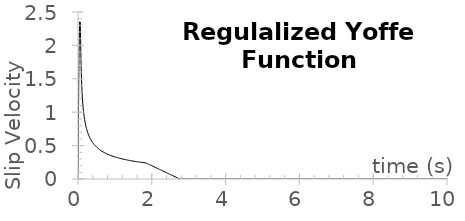
| Category | velocity |
|---|---|
| 0.0 | 0 |
| 0.01 | 0.806 |
| 0.02 | 1.444 |
| 0.03 | 1.914 |
| 0.04 | 2.217 |
| 0.05 | 2.352 |
| 0.06 | 2.32 |
| 0.07 | 2.119 |
| 0.08 | 1.798 |
| 0.09 | 1.57 |
| 0.1 | 1.412 |
| 0.11 | 1.293 |
| 0.12 | 1.2 |
| 0.13 | 1.125 |
| 0.14 | 1.062 |
| 0.15 | 1.009 |
| 0.16 | 0.963 |
| 0.17 | 0.922 |
| 0.18 | 0.887 |
| 0.19 | 0.855 |
| 0.2 | 0.826 |
| 0.21 | 0.801 |
| 0.22 | 0.777 |
| 0.23 | 0.755 |
| 0.24 | 0.735 |
| 0.25 | 0.717 |
| 0.26 | 0.7 |
| 0.27 | 0.684 |
| 0.28 | 0.669 |
| 0.29 | 0.655 |
| 0.3 | 0.642 |
| 0.31 | 0.63 |
| 0.32 | 0.618 |
| 0.33 | 0.607 |
| 0.34 | 0.596 |
| 0.35 | 0.586 |
| 0.36 | 0.577 |
| 0.37 | 0.568 |
| 0.38 | 0.559 |
| 0.39 | 0.551 |
| 0.4 | 0.543 |
| 0.41 | 0.536 |
| 0.42 | 0.528 |
| 0.43 | 0.521 |
| 0.44 | 0.515 |
| 0.45 | 0.508 |
| 0.46 | 0.502 |
| 0.47 | 0.496 |
| 0.48 | 0.49 |
| 0.49 | 0.485 |
| 0.5 | 0.479 |
| 0.51 | 0.474 |
| 0.52 | 0.469 |
| 0.53 | 0.464 |
| 0.54 | 0.46 |
| 0.55 | 0.455 |
| 0.56 | 0.45 |
| 0.57 | 0.446 |
| 0.58 | 0.442 |
| 0.59 | 0.438 |
| 0.6 | 0.434 |
| 0.61 | 0.43 |
| 0.62 | 0.426 |
| 0.63 | 0.422 |
| 0.64 | 0.419 |
| 0.65 | 0.415 |
| 0.66 | 0.412 |
| 0.67 | 0.409 |
| 0.68 | 0.405 |
| 0.69 | 0.402 |
| 0.7 | 0.399 |
| 0.71 | 0.396 |
| 0.72 | 0.393 |
| 0.73 | 0.39 |
| 0.74 | 0.387 |
| 0.75 | 0.385 |
| 0.76 | 0.382 |
| 0.77 | 0.379 |
| 0.78 | 0.377 |
| 0.79 | 0.374 |
| 0.8 | 0.372 |
| 0.81 | 0.369 |
| 0.82 | 0.367 |
| 0.83 | 0.365 |
| 0.84 | 0.362 |
| 0.85 | 0.36 |
| 0.86 | 0.358 |
| 0.87 | 0.356 |
| 0.88 | 0.353 |
| 0.89 | 0.351 |
| 0.9 | 0.349 |
| 0.91 | 0.347 |
| 0.92 | 0.345 |
| 0.93 | 0.343 |
| 0.94 | 0.341 |
| 0.95 | 0.339 |
| 0.96 | 0.338 |
| 0.97 | 0.336 |
| 0.98 | 0.334 |
| 0.99 | 0.332 |
| 1.0 | 0.33 |
| 1.01 | 0.329 |
| 1.02 | 0.327 |
| 1.03 | 0.325 |
| 1.04 | 0.324 |
| 1.05 | 0.322 |
| 1.06 | 0.32 |
| 1.07 | 0.319 |
| 1.08 | 0.317 |
| 1.09 | 0.316 |
| 1.1 | 0.314 |
| 1.11 | 0.313 |
| 1.12 | 0.311 |
| 1.13 | 0.31 |
| 1.14 | 0.308 |
| 1.15 | 0.307 |
| 1.16 | 0.306 |
| 1.17 | 0.304 |
| 1.18 | 0.303 |
| 1.19 | 0.302 |
| 1.2 | 0.3 |
| 1.21 | 0.299 |
| 1.22 | 0.298 |
| 1.23 | 0.296 |
| 1.24 | 0.295 |
| 1.25 | 0.294 |
| 1.26 | 0.293 |
| 1.27 | 0.292 |
| 1.28 | 0.29 |
| 1.29 | 0.289 |
| 1.3 | 0.288 |
| 1.31 | 0.287 |
| 1.32 | 0.286 |
| 1.33 | 0.285 |
| 1.34 | 0.284 |
| 1.35 | 0.282 |
| 1.36 | 0.281 |
| 1.37 | 0.28 |
| 1.38 | 0.279 |
| 1.39 | 0.278 |
| 1.4 | 0.277 |
| 1.41 | 0.276 |
| 1.42 | 0.275 |
| 1.43 | 0.274 |
| 1.44 | 0.273 |
| 1.45 | 0.272 |
| 1.46 | 0.271 |
| 1.47 | 0.27 |
| 1.48 | 0.269 |
| 1.49 | 0.268 |
| 1.5 | 0.268 |
| 1.51 | 0.267 |
| 1.52 | 0.266 |
| 1.53 | 0.265 |
| 1.54 | 0.264 |
| 1.55 | 0.263 |
| 1.56 | 0.262 |
| 1.57 | 0.261 |
| 1.58 | 0.26 |
| 1.59 | 0.26 |
| 1.6 | 0.259 |
| 1.61 | 0.258 |
| 1.62 | 0.257 |
| 1.63 | 0.256 |
| 1.64 | 0.255 |
| 1.65 | 0.255 |
| 1.66 | 0.254 |
| 1.67 | 0.253 |
| 1.68 | 0.252 |
| 1.69 | 0.252 |
| 1.7 | 0.251 |
| 1.71 | 0.25 |
| 1.72 | 0.249 |
| 1.73 | 0.249 |
| 1.74 | 0.248 |
| 1.75 | 0.247 |
| 1.76 | 0.246 |
| 1.77 | 0.246 |
| 1.78 | 0.245 |
| 1.79 | 0.244 |
| 1.8 | 0.244 |
| 1.81 | 0.243 |
| 1.82 | 0.242 |
| 1.83 | 0.241 |
| 1.84 | 0.241 |
| 1.85 | 0.238 |
| 1.86 | 0.236 |
| 1.87 | 0.233 |
| 1.88 | 0.23 |
| 1.89 | 0.228 |
| 1.9 | 0.225 |
| 1.91 | 0.222 |
| 1.92 | 0.22 |
| 1.93 | 0.217 |
| 1.94 | 0.215 |
| 1.95 | 0.212 |
| 1.96 | 0.209 |
| 1.97 | 0.207 |
| 1.98 | 0.204 |
| 1.99 | 0.202 |
| 2.0 | 0.199 |
| 2.01 | 0.196 |
| 2.02 | 0.194 |
| 2.03 | 0.191 |
| 2.04 | 0.188 |
| 2.05 | 0.186 |
| 2.06 | 0.183 |
| 2.07 | 0.181 |
| 2.08 | 0.178 |
| 2.09 | 0.175 |
| 2.1 | 0.173 |
| 2.11 | 0.17 |
| 2.12 | 0.168 |
| 2.13 | 0.165 |
| 2.14 | 0.162 |
| 2.15 | 0.16 |
| 2.16 | 0.157 |
| 2.17 | 0.154 |
| 2.18 | 0.152 |
| 2.19 | 0.149 |
| 2.2 | 0.147 |
| 2.21 | 0.144 |
| 2.22 | 0.141 |
| 2.23 | 0.139 |
| 2.24 | 0.136 |
| 2.25 | 0.133 |
| 2.26 | 0.131 |
| 2.27 | 0.128 |
| 2.28 | 0.126 |
| 2.29 | 0.123 |
| 2.3 | 0.12 |
| 2.31 | 0.118 |
| 2.32 | 0.115 |
| 2.33 | 0.113 |
| 2.34 | 0.11 |
| 2.35 | 0.107 |
| 2.36 | 0.105 |
| 2.37 | 0.102 |
| 2.38 | 0.099 |
| 2.39 | 0.097 |
| 2.4 | 0.094 |
| 2.41 | 0.092 |
| 2.42 | 0.089 |
| 2.43 | 0.086 |
| 2.44 | 0.084 |
| 2.45 | 0.081 |
| 2.46 | 0.079 |
| 2.47 | 0.076 |
| 2.48 | 0.073 |
| 2.49 | 0.071 |
| 2.5 | 0.068 |
| 2.51 | 0.065 |
| 2.52 | 0.063 |
| 2.53 | 0.06 |
| 2.54 | 0.058 |
| 2.55 | 0.055 |
| 2.56 | 0.052 |
| 2.57 | 0.05 |
| 2.58 | 0.047 |
| 2.59 | 0.044 |
| 2.6 | 0.042 |
| 2.61 | 0.039 |
| 2.62 | 0.037 |
| 2.63 | 0.034 |
| 2.64 | 0.031 |
| 2.65 | 0.029 |
| 2.66 | 0.026 |
| 2.67 | 0.024 |
| 2.68 | 0.021 |
| 2.69 | 0.018 |
| 2.7 | 0.016 |
| 2.71 | 0.013 |
| 2.72 | 0.01 |
| 2.73 | 0.008 |
| 2.74 | 0.005 |
| 2.75 | 0.003 |
| 2.76 | 0 |
| 2.77 | 0 |
| 2.78 | 0 |
| 2.79 | 0 |
| 2.8 | 0 |
| 2.81 | 0 |
| 2.82 | 0 |
| 2.83 | 0 |
| 2.84 | 0 |
| 2.85 | 0 |
| 2.86 | 0 |
| 2.87 | 0 |
| 2.88 | 0 |
| 2.89 | 0 |
| 2.9 | 0 |
| 2.91 | 0 |
| 2.92 | 0 |
| 2.93 | 0 |
| 2.94 | 0 |
| 2.95 | 0 |
| 2.96 | 0 |
| 2.97 | 0 |
| 2.98 | 0 |
| 2.99 | 0 |
| 3.0 | 0 |
| 3.01 | 0 |
| 3.02 | 0 |
| 3.03 | 0 |
| 3.04 | 0 |
| 3.05 | 0 |
| 3.06 | 0 |
| 3.07 | 0 |
| 3.08 | 0 |
| 3.09 | 0 |
| 3.1 | 0 |
| 3.11 | 0 |
| 3.12 | 0 |
| 3.13 | 0 |
| 3.14 | 0 |
| 3.15 | 0 |
| 3.16 | 0 |
| 3.17 | 0 |
| 3.18 | 0 |
| 3.19 | 0 |
| 3.2 | 0 |
| 3.21 | 0 |
| 3.22 | 0 |
| 3.23 | 0 |
| 3.24 | 0 |
| 3.25 | 0 |
| 3.26 | 0 |
| 3.27 | 0 |
| 3.28 | 0 |
| 3.29 | 0 |
| 3.3 | 0 |
| 3.31 | 0 |
| 3.32 | 0 |
| 3.33 | 0 |
| 3.34 | 0 |
| 3.35 | 0 |
| 3.36 | 0 |
| 3.37 | 0 |
| 3.38 | 0 |
| 3.39 | 0 |
| 3.4 | 0 |
| 3.41 | 0 |
| 3.42 | 0 |
| 3.43 | 0 |
| 3.44 | 0 |
| 3.45 | 0 |
| 3.46 | 0 |
| 3.47 | 0 |
| 3.48 | 0 |
| 3.49 | 0 |
| 3.5 | 0 |
| 3.51 | 0 |
| 3.52 | 0 |
| 3.53 | 0 |
| 3.54 | 0 |
| 3.55 | 0 |
| 3.56 | 0 |
| 3.57 | 0 |
| 3.58 | 0 |
| 3.59 | 0 |
| 3.6 | 0 |
| 3.61 | 0 |
| 3.62 | 0 |
| 3.63 | 0 |
| 3.64 | 0 |
| 3.65 | 0 |
| 3.66 | 0 |
| 3.67 | 0 |
| 3.68 | 0 |
| 3.69 | 0 |
| 3.7 | 0 |
| 3.71 | 0 |
| 3.72 | 0 |
| 3.73 | 0 |
| 3.74 | 0 |
| 3.75 | 0 |
| 3.76 | 0 |
| 3.77 | 0 |
| 3.78 | 0 |
| 3.79 | 0 |
| 3.8 | 0 |
| 3.81 | 0 |
| 3.82 | 0 |
| 3.83 | 0 |
| 3.84 | 0 |
| 3.85 | 0 |
| 3.86 | 0 |
| 3.87 | 0 |
| 3.88 | 0 |
| 3.89 | 0 |
| 3.9 | 0 |
| 3.91 | 0 |
| 3.92 | 0 |
| 3.93 | 0 |
| 3.94 | 0 |
| 3.95 | 0 |
| 3.96 | 0 |
| 3.97 | 0 |
| 3.98 | 0 |
| 3.99 | 0 |
| 4.0 | 0 |
| 4.01 | 0 |
| 4.02 | 0 |
| 4.03 | 0 |
| 4.04 | 0 |
| 4.05 | 0 |
| 4.06 | 0 |
| 4.07 | 0 |
| 4.08 | 0 |
| 4.09 | 0 |
| 4.1 | 0 |
| 4.11 | 0 |
| 4.12 | 0 |
| 4.13 | 0 |
| 4.14 | 0 |
| 4.15 | 0 |
| 4.16 | 0 |
| 4.17 | 0 |
| 4.18 | 0 |
| 4.19 | 0 |
| 4.2 | 0 |
| 4.21 | 0 |
| 4.22 | 0 |
| 4.23 | 0 |
| 4.24 | 0 |
| 4.25 | 0 |
| 4.26 | 0 |
| 4.27 | 0 |
| 4.28 | 0 |
| 4.29 | 0 |
| 4.3 | 0 |
| 4.31 | 0 |
| 4.32 | 0 |
| 4.33 | 0 |
| 4.34 | 0 |
| 4.35 | 0 |
| 4.36 | 0 |
| 4.37 | 0 |
| 4.38 | 0 |
| 4.39 | 0 |
| 4.4 | 0 |
| 4.41 | 0 |
| 4.42 | 0 |
| 4.43 | 0 |
| 4.44 | 0 |
| 4.45 | 0 |
| 4.46 | 0 |
| 4.47 | 0 |
| 4.48 | 0 |
| 4.49 | 0 |
| 4.5 | 0 |
| 4.51 | 0 |
| 4.52 | 0 |
| 4.53 | 0 |
| 4.54 | 0 |
| 4.55 | 0 |
| 4.56 | 0 |
| 4.57 | 0 |
| 4.58 | 0 |
| 4.59 | 0 |
| 4.6 | 0 |
| 4.61 | 0 |
| 4.62 | 0 |
| 4.63 | 0 |
| 4.64 | 0 |
| 4.65 | 0 |
| 4.66 | 0 |
| 4.67 | 0 |
| 4.68 | 0 |
| 4.69 | 0 |
| 4.7 | 0 |
| 4.71 | 0 |
| 4.72 | 0 |
| 4.73 | 0 |
| 4.74 | 0 |
| 4.75 | 0 |
| 4.76 | 0 |
| 4.77 | 0 |
| 4.78 | 0 |
| 4.79 | 0 |
| 4.8 | 0 |
| 4.81 | 0 |
| 4.82 | 0 |
| 4.83 | 0 |
| 4.84 | 0 |
| 4.85 | 0 |
| 4.86 | 0 |
| 4.87 | 0 |
| 4.88 | 0 |
| 4.89 | 0 |
| 4.9 | 0 |
| 4.91 | 0 |
| 4.92 | 0 |
| 4.93 | 0 |
| 4.94 | 0 |
| 4.95 | 0 |
| 4.96 | 0 |
| 4.97 | 0 |
| 4.98 | 0 |
| 4.99 | 0 |
| 5.0 | 0 |
| 5.01 | 0 |
| 5.02 | 0 |
| 5.03 | 0 |
| 5.04 | 0 |
| 5.05 | 0 |
| 5.06 | 0 |
| 5.07 | 0 |
| 5.08 | 0 |
| 5.09 | 0 |
| 5.1 | 0 |
| 5.11 | 0 |
| 5.12 | 0 |
| 5.13 | 0 |
| 5.14 | 0 |
| 5.15 | 0 |
| 5.16 | 0 |
| 5.17 | 0 |
| 5.18 | 0 |
| 5.19 | 0 |
| 5.2 | 0 |
| 5.21 | 0 |
| 5.22 | 0 |
| 5.23 | 0 |
| 5.24 | 0 |
| 5.25 | 0 |
| 5.26 | 0 |
| 5.27 | 0 |
| 5.28 | 0 |
| 5.29 | 0 |
| 5.3 | 0 |
| 5.31 | 0 |
| 5.32 | 0 |
| 5.33 | 0 |
| 5.34 | 0 |
| 5.35 | 0 |
| 5.36 | 0 |
| 5.37 | 0 |
| 5.38 | 0 |
| 5.39 | 0 |
| 5.4 | 0 |
| 5.41 | 0 |
| 5.42 | 0 |
| 5.43 | 0 |
| 5.44 | 0 |
| 5.45 | 0 |
| 5.46 | 0 |
| 5.47 | 0 |
| 5.48 | 0 |
| 5.49 | 0 |
| 5.5 | 0 |
| 5.51 | 0 |
| 5.52 | 0 |
| 5.53 | 0 |
| 5.54 | 0 |
| 5.55 | 0 |
| 5.56 | 0 |
| 5.57 | 0 |
| 5.58 | 0 |
| 5.59 | 0 |
| 5.6 | 0 |
| 5.61 | 0 |
| 5.62 | 0 |
| 5.63 | 0 |
| 5.64 | 0 |
| 5.65 | 0 |
| 5.66 | 0 |
| 5.67 | 0 |
| 5.68 | 0 |
| 5.69 | 0 |
| 5.7 | 0 |
| 5.71 | 0 |
| 5.72 | 0 |
| 5.73 | 0 |
| 5.74 | 0 |
| 5.75 | 0 |
| 5.76 | 0 |
| 5.77 | 0 |
| 5.78 | 0 |
| 5.79 | 0 |
| 5.8 | 0 |
| 5.81 | 0 |
| 5.82 | 0 |
| 5.83 | 0 |
| 5.84 | 0 |
| 5.85 | 0 |
| 5.86 | 0 |
| 5.87 | 0 |
| 5.88 | 0 |
| 5.89 | 0 |
| 5.9 | 0 |
| 5.91 | 0 |
| 5.92 | 0 |
| 5.93 | 0 |
| 5.94 | 0 |
| 5.95 | 0 |
| 5.96 | 0 |
| 5.97 | 0 |
| 5.98 | 0 |
| 5.99 | 0 |
| 6.0 | 0 |
| 6.01 | 0 |
| 6.02 | 0 |
| 6.03 | 0 |
| 6.04 | 0 |
| 6.05 | 0 |
| 6.06 | 0 |
| 6.07 | 0 |
| 6.08 | 0 |
| 6.09 | 0 |
| 6.1 | 0 |
| 6.11 | 0 |
| 6.12 | 0 |
| 6.13 | 0 |
| 6.14 | 0 |
| 6.15 | 0 |
| 6.16 | 0 |
| 6.17 | 0 |
| 6.18 | 0 |
| 6.19 | 0 |
| 6.2 | 0 |
| 6.21 | 0 |
| 6.22 | 0 |
| 6.23 | 0 |
| 6.24 | 0 |
| 6.25 | 0 |
| 6.26 | 0 |
| 6.27 | 0 |
| 6.28 | 0 |
| 6.29 | 0 |
| 6.3 | 0 |
| 6.31 | 0 |
| 6.32 | 0 |
| 6.33 | 0 |
| 6.34 | 0 |
| 6.35 | 0 |
| 6.36 | 0 |
| 6.37 | 0 |
| 6.38 | 0 |
| 6.39 | 0 |
| 6.4 | 0 |
| 6.41 | 0 |
| 6.42 | 0 |
| 6.43 | 0 |
| 6.44 | 0 |
| 6.45 | 0 |
| 6.46 | 0 |
| 6.47 | 0 |
| 6.48 | 0 |
| 6.49 | 0 |
| 6.5 | 0 |
| 6.51 | 0 |
| 6.52 | 0 |
| 6.53 | 0 |
| 6.54 | 0 |
| 6.55 | 0 |
| 6.56 | 0 |
| 6.57 | 0 |
| 6.58 | 0 |
| 6.59 | 0 |
| 6.6 | 0 |
| 6.61 | 0 |
| 6.62 | 0 |
| 6.63 | 0 |
| 6.64 | 0 |
| 6.65 | 0 |
| 6.66 | 0 |
| 6.67 | 0 |
| 6.68 | 0 |
| 6.69 | 0 |
| 6.7 | 0 |
| 6.71 | 0 |
| 6.72 | 0 |
| 6.73 | 0 |
| 6.74 | 0 |
| 6.75 | 0 |
| 6.76 | 0 |
| 6.77 | 0 |
| 6.78 | 0 |
| 6.79 | 0 |
| 6.8 | 0 |
| 6.81 | 0 |
| 6.82 | 0 |
| 6.83 | 0 |
| 6.84 | 0 |
| 6.85 | 0 |
| 6.86 | 0 |
| 6.87 | 0 |
| 6.88 | 0 |
| 6.89 | 0 |
| 6.9 | 0 |
| 6.91 | 0 |
| 6.92 | 0 |
| 6.93 | 0 |
| 6.94 | 0 |
| 6.95 | 0 |
| 6.96 | 0 |
| 6.97 | 0 |
| 6.98 | 0 |
| 6.99 | 0 |
| 7.0 | 0 |
| 7.01 | 0 |
| 7.02 | 0 |
| 7.03 | 0 |
| 7.04 | 0 |
| 7.05 | 0 |
| 7.06 | 0 |
| 7.07 | 0 |
| 7.08 | 0 |
| 7.09 | 0 |
| 7.1 | 0 |
| 7.11 | 0 |
| 7.12 | 0 |
| 7.13 | 0 |
| 7.14 | 0 |
| 7.15 | 0 |
| 7.16 | 0 |
| 7.17 | 0 |
| 7.18 | 0 |
| 7.19 | 0 |
| 7.2 | 0 |
| 7.21 | 0 |
| 7.22 | 0 |
| 7.23 | 0 |
| 7.24 | 0 |
| 7.25 | 0 |
| 7.26 | 0 |
| 7.27 | 0 |
| 7.28 | 0 |
| 7.29 | 0 |
| 7.3 | 0 |
| 7.31 | 0 |
| 7.32 | 0 |
| 7.33 | 0 |
| 7.34 | 0 |
| 7.35 | 0 |
| 7.36 | 0 |
| 7.37 | 0 |
| 7.38 | 0 |
| 7.39 | 0 |
| 7.4 | 0 |
| 7.41 | 0 |
| 7.42 | 0 |
| 7.43 | 0 |
| 7.44 | 0 |
| 7.45 | 0 |
| 7.46 | 0 |
| 7.47 | 0 |
| 7.48 | 0 |
| 7.49 | 0 |
| 7.5 | 0 |
| 7.51 | 0 |
| 7.52 | 0 |
| 7.53 | 0 |
| 7.54 | 0 |
| 7.55 | 0 |
| 7.56 | 0 |
| 7.57 | 0 |
| 7.58 | 0 |
| 7.59 | 0 |
| 7.6 | 0 |
| 7.61 | 0 |
| 7.62 | 0 |
| 7.63 | 0 |
| 7.64 | 0 |
| 7.65 | 0 |
| 7.66 | 0 |
| 7.67 | 0 |
| 7.68 | 0 |
| 7.69 | 0 |
| 7.7 | 0 |
| 7.71 | 0 |
| 7.72 | 0 |
| 7.73 | 0 |
| 7.74 | 0 |
| 7.75 | 0 |
| 7.76 | 0 |
| 7.77 | 0 |
| 7.78 | 0 |
| 7.79 | 0 |
| 7.8 | 0 |
| 7.81 | 0 |
| 7.82 | 0 |
| 7.83 | 0 |
| 7.84 | 0 |
| 7.85 | 0 |
| 7.86 | 0 |
| 7.87 | 0 |
| 7.88 | 0 |
| 7.89 | 0 |
| 7.9 | 0 |
| 7.91 | 0 |
| 7.92 | 0 |
| 7.93 | 0 |
| 7.94 | 0 |
| 7.95 | 0 |
| 7.96 | 0 |
| 7.97 | 0 |
| 7.98 | 0 |
| 7.99 | 0 |
| 8.0 | 0 |
| 8.01 | 0 |
| 8.02 | 0 |
| 8.03 | 0 |
| 8.04 | 0 |
| 8.05 | 0 |
| 8.06 | 0 |
| 8.07 | 0 |
| 8.08 | 0 |
| 8.09 | 0 |
| 8.1 | 0 |
| 8.11 | 0 |
| 8.12 | 0 |
| 8.13 | 0 |
| 8.14 | 0 |
| 8.15 | 0 |
| 8.16 | 0 |
| 8.17 | 0 |
| 8.18 | 0 |
| 8.19 | 0 |
| 8.2 | 0 |
| 8.21 | 0 |
| 8.22 | 0 |
| 8.23 | 0 |
| 8.24 | 0 |
| 8.25 | 0 |
| 8.26 | 0 |
| 8.27 | 0 |
| 8.28 | 0 |
| 8.29 | 0 |
| 8.3 | 0 |
| 8.31 | 0 |
| 8.32 | 0 |
| 8.33 | 0 |
| 8.34 | 0 |
| 8.35 | 0 |
| 8.36 | 0 |
| 8.37 | 0 |
| 8.38 | 0 |
| 8.39 | 0 |
| 8.4 | 0 |
| 8.41 | 0 |
| 8.42 | 0 |
| 8.43 | 0 |
| 8.44 | 0 |
| 8.45 | 0 |
| 8.46 | 0 |
| 8.47 | 0 |
| 8.48 | 0 |
| 8.49 | 0 |
| 8.5 | 0 |
| 8.51 | 0 |
| 8.52 | 0 |
| 8.53 | 0 |
| 8.54 | 0 |
| 8.55 | 0 |
| 8.56 | 0 |
| 8.57 | 0 |
| 8.58 | 0 |
| 8.59 | 0 |
| 8.6 | 0 |
| 8.61 | 0 |
| 8.62 | 0 |
| 8.63 | 0 |
| 8.64 | 0 |
| 8.65 | 0 |
| 8.66 | 0 |
| 8.67 | 0 |
| 8.68 | 0 |
| 8.69 | 0 |
| 8.7 | 0 |
| 8.71 | 0 |
| 8.72 | 0 |
| 8.73 | 0 |
| 8.74 | 0 |
| 8.75 | 0 |
| 8.76 | 0 |
| 8.77 | 0 |
| 8.78 | 0 |
| 8.79 | 0 |
| 8.8 | 0 |
| 8.81 | 0 |
| 8.82 | 0 |
| 8.83 | 0 |
| 8.84 | 0 |
| 8.85 | 0 |
| 8.86 | 0 |
| 8.87 | 0 |
| 8.88 | 0 |
| 8.89 | 0 |
| 8.9 | 0 |
| 8.91 | 0 |
| 8.92 | 0 |
| 8.93 | 0 |
| 8.94 | 0 |
| 8.95 | 0 |
| 8.96 | 0 |
| 8.97 | 0 |
| 8.98 | 0 |
| 8.99 | 0 |
| 9.0 | 0 |
| 9.01 | 0 |
| 9.02 | 0 |
| 9.03 | 0 |
| 9.04 | 0 |
| 9.05 | 0 |
| 9.06 | 0 |
| 9.07 | 0 |
| 9.08 | 0 |
| 9.09 | 0 |
| 9.1 | 0 |
| 9.11 | 0 |
| 9.12 | 0 |
| 9.13 | 0 |
| 9.14 | 0 |
| 9.15 | 0 |
| 9.16 | 0 |
| 9.17 | 0 |
| 9.18 | 0 |
| 9.19 | 0 |
| 9.2 | 0 |
| 9.21 | 0 |
| 9.22 | 0 |
| 9.23 | 0 |
| 9.24 | 0 |
| 9.25 | 0 |
| 9.26 | 0 |
| 9.27 | 0 |
| 9.28 | 0 |
| 9.29 | 0 |
| 9.3 | 0 |
| 9.31 | 0 |
| 9.32 | 0 |
| 9.33 | 0 |
| 9.34 | 0 |
| 9.35 | 0 |
| 9.36 | 0 |
| 9.37 | 0 |
| 9.38 | 0 |
| 9.39 | 0 |
| 9.4 | 0 |
| 9.41 | 0 |
| 9.42 | 0 |
| 9.43 | 0 |
| 9.44 | 0 |
| 9.45 | 0 |
| 9.46 | 0 |
| 9.47 | 0 |
| 9.48 | 0 |
| 9.49 | 0 |
| 9.5 | 0 |
| 9.51 | 0 |
| 9.52 | 0 |
| 9.53 | 0 |
| 9.54 | 0 |
| 9.55 | 0 |
| 9.56 | 0 |
| 9.57 | 0 |
| 9.58 | 0 |
| 9.59 | 0 |
| 9.6 | 0 |
| 9.61 | 0 |
| 9.62 | 0 |
| 9.63 | 0 |
| 9.64 | 0 |
| 9.65 | 0 |
| 9.66 | 0 |
| 9.67 | 0 |
| 9.68 | 0 |
| 9.69 | 0 |
| 9.7 | 0 |
| 9.71 | 0 |
| 9.72 | 0 |
| 9.73 | 0 |
| 9.74 | 0 |
| 9.75 | 0 |
| 9.76 | 0 |
| 9.77 | 0 |
| 9.78 | 0 |
| 9.79 | 0 |
| 9.8 | 0 |
| 9.81 | 0 |
| 9.82 | 0 |
| 9.83 | 0 |
| 9.84 | 0 |
| 9.85 | 0 |
| 9.86 | 0 |
| 9.87 | 0 |
| 9.88 | 0 |
| 9.89 | 0 |
| 9.9 | 0 |
| 9.91 | 0 |
| 9.92 | 0 |
| 9.93 | 0 |
| 9.94 | 0 |
| 9.95 | 0 |
| 9.96 | 0 |
| 9.97 | 0 |
| 9.98 | 0 |
| 9.99 | 0 |
| 10.0 | 0 |
| 10.01 | 0 |
| 10.02 | 0 |
| 10.03 | 0 |
| 10.04 | 0 |
| 10.05 | 0 |
| 10.06 | 0 |
| 10.07 | 0 |
| 10.08 | 0 |
| 10.09 | 0 |
| 10.1 | 0 |
| 10.11 | 0 |
| 10.12 | 0 |
| 10.13 | 0 |
| 10.14 | 0 |
| 10.15 | 0 |
| 10.16 | 0 |
| 10.17 | 0 |
| 10.18 | 0 |
| 10.19 | 0 |
| 10.2 | 0 |
| 10.21 | 0 |
| 10.22 | 0 |
| 10.23 | 0 |
| 10.24 | 0 |
| 10.25 | 0 |
| 10.26 | 0 |
| 10.27 | 0 |
| 10.28 | 0 |
| 10.29 | 0 |
| 10.3 | 0 |
| 10.31 | 0 |
| 10.32 | 0 |
| 10.33 | 0 |
| 10.34 | 0 |
| 10.35 | 0 |
| 10.36 | 0 |
| 10.37 | 0 |
| 10.38 | 0 |
| 10.39 | 0 |
| 10.4 | 0 |
| 10.41 | 0 |
| 10.42 | 0 |
| 10.43 | 0 |
| 10.44 | 0 |
| 10.45 | 0 |
| 10.46 | 0 |
| 10.47 | 0 |
| 10.48 | 0 |
| 10.49 | 0 |
| 10.5 | 0 |
| 10.51 | 0 |
| 10.52 | 0 |
| 10.53 | 0 |
| 10.54 | 0 |
| 10.55 | 0 |
| 10.56 | 0 |
| 10.57 | 0 |
| 10.58 | 0 |
| 10.59 | 0 |
| 10.6 | 0 |
| 10.61 | 0 |
| 10.62 | 0 |
| 10.63 | 0 |
| 10.64 | 0 |
| 10.65 | 0 |
| 10.66 | 0 |
| 10.67 | 0 |
| 10.68 | 0 |
| 10.69 | 0 |
| 10.7 | 0 |
| 10.71 | 0 |
| 10.72 | 0 |
| 10.73 | 0 |
| 10.74 | 0 |
| 10.75 | 0 |
| 10.76 | 0 |
| 10.77 | 0 |
| 10.78 | 0 |
| 10.79 | 0 |
| 10.8 | 0 |
| 10.81 | 0 |
| 10.82 | 0 |
| 10.83 | 0 |
| 10.84 | 0 |
| 10.85 | 0 |
| 10.86 | 0 |
| 10.87 | 0 |
| 10.88 | 0 |
| 10.89 | 0 |
| 10.9 | 0 |
| 10.91 | 0 |
| 10.92 | 0 |
| 10.93 | 0 |
| 10.94 | 0 |
| 10.95 | 0 |
| 10.96 | 0 |
| 10.97 | 0 |
| 10.98 | 0 |
| 10.99 | 0 |
| 11.0 | 0 |
| 11.01 | 0 |
| 11.02 | 0 |
| 11.03 | 0 |
| 11.04 | 0 |
| 11.05 | 0 |
| 11.06 | 0 |
| 11.07 | 0 |
| 11.08 | 0 |
| 11.09 | 0 |
| 11.1 | 0 |
| 11.11 | 0 |
| 11.12 | 0 |
| 11.13 | 0 |
| 11.14 | 0 |
| 11.15 | 0 |
| 11.16 | 0 |
| 11.17 | 0 |
| 11.18 | 0 |
| 11.19 | 0 |
| 11.2 | 0 |
| 11.21 | 0 |
| 11.22 | 0 |
| 11.23 | 0 |
| 11.24 | 0 |
| 11.25 | 0 |
| 11.26 | 0 |
| 11.27 | 0 |
| 11.28 | 0 |
| 11.29 | 0 |
| 11.3 | 0 |
| 11.31 | 0 |
| 11.32 | 0 |
| 11.33 | 0 |
| 11.34 | 0 |
| 11.35 | 0 |
| 11.36 | 0 |
| 11.37 | 0 |
| 11.38 | 0 |
| 11.39 | 0 |
| 11.4 | 0 |
| 11.41 | 0 |
| 11.42 | 0 |
| 11.43 | 0 |
| 11.44 | 0 |
| 11.45 | 0 |
| 11.46 | 0 |
| 11.47 | 0 |
| 11.48 | 0 |
| 11.49 | 0 |
| 11.5 | 0 |
| 11.51 | 0 |
| 11.52 | 0 |
| 11.53 | 0 |
| 11.54 | 0 |
| 11.55 | 0 |
| 11.56 | 0 |
| 11.57 | 0 |
| 11.58 | 0 |
| 11.59 | 0 |
| 11.6 | 0 |
| 11.61 | 0 |
| 11.62 | 0 |
| 11.63 | 0 |
| 11.64 | 0 |
| 11.65 | 0 |
| 11.66 | 0 |
| 11.67 | 0 |
| 11.68 | 0 |
| 11.69 | 0 |
| 11.7 | 0 |
| 11.71 | 0 |
| 11.72 | 0 |
| 11.73 | 0 |
| 11.74 | 0 |
| 11.75 | 0 |
| 11.76 | 0 |
| 11.77 | 0 |
| 11.78 | 0 |
| 11.79 | 0 |
| 11.8 | 0 |
| 11.81 | 0 |
| 11.82 | 0 |
| 11.83 | 0 |
| 11.84 | 0 |
| 11.85 | 0 |
| 11.86 | 0 |
| 11.87 | 0 |
| 11.88 | 0 |
| 11.89 | 0 |
| 11.9 | 0 |
| 11.91 | 0 |
| 11.92 | 0 |
| 11.93 | 0 |
| 11.94 | 0 |
| 11.95 | 0 |
| 11.96 | 0 |
| 11.97 | 0 |
| 11.98 | 0 |
| 11.99 | 0 |
| 12.0 | 0 |
| 12.01 | 0 |
| 12.02 | 0 |
| 12.03 | 0 |
| 12.04 | 0 |
| 12.05 | 0 |
| 12.06 | 0 |
| 12.07 | 0 |
| 12.08 | 0 |
| 12.09 | 0 |
| 12.1 | 0 |
| 12.11 | 0 |
| 12.12 | 0 |
| 12.13 | 0 |
| 12.14 | 0 |
| 12.15 | 0 |
| 12.16 | 0 |
| 12.17 | 0 |
| 12.18 | 0 |
| 12.19 | 0 |
| 12.2 | 0 |
| 12.21 | 0 |
| 12.22 | 0 |
| 12.23 | 0 |
| 12.24 | 0 |
| 12.25 | 0 |
| 12.26 | 0 |
| 12.27 | 0 |
| 12.28 | 0 |
| 12.29 | 0 |
| 12.3 | 0 |
| 12.31 | 0 |
| 12.32 | 0 |
| 12.33 | 0 |
| 12.34 | 0 |
| 12.35 | 0 |
| 12.36 | 0 |
| 12.37 | 0 |
| 12.38 | 0 |
| 12.39 | 0 |
| 12.4 | 0 |
| 12.41 | 0 |
| 12.42 | 0 |
| 12.43 | 0 |
| 12.44 | 0 |
| 12.45 | 0 |
| 12.46 | 0 |
| 12.47 | 0 |
| 12.48 | 0 |
| 12.49 | 0 |
| 12.5 | 0 |
| 12.51 | 0 |
| 12.52 | 0 |
| 12.53 | 0 |
| 12.54 | 0 |
| 12.55 | 0 |
| 12.56 | 0 |
| 12.57 | 0 |
| 12.58 | 0 |
| 12.59 | 0 |
| 12.6 | 0 |
| 12.61 | 0 |
| 12.62 | 0 |
| 12.63 | 0 |
| 12.64 | 0 |
| 12.65 | 0 |
| 12.66 | 0 |
| 12.67 | 0 |
| 12.68 | 0 |
| 12.69 | 0 |
| 12.7 | 0 |
| 12.71 | 0 |
| 12.72 | 0 |
| 12.73 | 0 |
| 12.74 | 0 |
| 12.75 | 0 |
| 12.76 | 0 |
| 12.77 | 0 |
| 12.78 | 0 |
| 12.79 | 0 |
| 12.8 | 0 |
| 12.81 | 0 |
| 12.82 | 0 |
| 12.83 | 0 |
| 12.84 | 0 |
| 12.85 | 0 |
| 12.86 | 0 |
| 12.87 | 0 |
| 12.88 | 0 |
| 12.89 | 0 |
| 12.9 | 0 |
| 12.91 | 0 |
| 12.92 | 0 |
| 12.93 | 0 |
| 12.94 | 0 |
| 12.95 | 0 |
| 12.96 | 0 |
| 12.97 | 0 |
| 12.98 | 0 |
| 12.99 | 0 |
| 13.0 | 0 |
| 13.01 | 0 |
| 13.02 | 0 |
| 13.03 | 0 |
| 13.04 | 0 |
| 13.05 | 0 |
| 13.06 | 0 |
| 13.07 | 0 |
| 13.08 | 0 |
| 13.09 | 0 |
| 13.1 | 0 |
| 13.11 | 0 |
| 13.12 | 0 |
| 13.13 | 0 |
| 13.14 | 0 |
| 13.15 | 0 |
| 13.16 | 0 |
| 13.17 | 0 |
| 13.18 | 0 |
| 13.19 | 0 |
| 13.2 | 0 |
| 13.21 | 0 |
| 13.22 | 0 |
| 13.23 | 0 |
| 13.24 | 0 |
| 13.25 | 0 |
| 13.26 | 0 |
| 13.27 | 0 |
| 13.28 | 0 |
| 13.29 | 0 |
| 13.3 | 0 |
| 13.31 | 0 |
| 13.32 | 0 |
| 13.33 | 0 |
| 13.34 | 0 |
| 13.35 | 0 |
| 13.36 | 0 |
| 13.37 | 0 |
| 13.38 | 0 |
| 13.39 | 0 |
| 13.4 | 0 |
| 13.41 | 0 |
| 13.42 | 0 |
| 13.43 | 0 |
| 13.44 | 0 |
| 13.45 | 0 |
| 13.46 | 0 |
| 13.47 | 0 |
| 13.48 | 0 |
| 13.49 | 0 |
| 13.5 | 0 |
| 13.51 | 0 |
| 13.52 | 0 |
| 13.53 | 0 |
| 13.54 | 0 |
| 13.55 | 0 |
| 13.56 | 0 |
| 13.57 | 0 |
| 13.58 | 0 |
| 13.59 | 0 |
| 13.6 | 0 |
| 13.61 | 0 |
| 13.62 | 0 |
| 13.63 | 0 |
| 13.64 | 0 |
| 13.65 | 0 |
| 13.66 | 0 |
| 13.67 | 0 |
| 13.68 | 0 |
| 13.69 | 0 |
| 13.7 | 0 |
| 13.71 | 0 |
| 13.72 | 0 |
| 13.73 | 0 |
| 13.74 | 0 |
| 13.75 | 0 |
| 13.76 | 0 |
| 13.77 | 0 |
| 13.78 | 0 |
| 13.79 | 0 |
| 13.8 | 0 |
| 13.81 | 0 |
| 13.82 | 0 |
| 13.83 | 0 |
| 13.84 | 0 |
| 13.85 | 0 |
| 13.86 | 0 |
| 13.87 | 0 |
| 13.88 | 0 |
| 13.89 | 0 |
| 13.9 | 0 |
| 13.91 | 0 |
| 13.92 | 0 |
| 13.93 | 0 |
| 13.94 | 0 |
| 13.95 | 0 |
| 13.96 | 0 |
| 13.97 | 0 |
| 13.98 | 0 |
| 13.99 | 0 |
| 14.0 | 0 |
| 14.01 | 0 |
| 14.02 | 0 |
| 14.03 | 0 |
| 14.04 | 0 |
| 14.05 | 0 |
| 14.06 | 0 |
| 14.07 | 0 |
| 14.08 | 0 |
| 14.09 | 0 |
| 14.1 | 0 |
| 14.11 | 0 |
| 14.12 | 0 |
| 14.13 | 0 |
| 14.14 | 0 |
| 14.15 | 0 |
| 14.16 | 0 |
| 14.17 | 0 |
| 14.18 | 0 |
| 14.19 | 0 |
| 14.2 | 0 |
| 14.21 | 0 |
| 14.22 | 0 |
| 14.23 | 0 |
| 14.24 | 0 |
| 14.25 | 0 |
| 14.26 | 0 |
| 14.27 | 0 |
| 14.28 | 0 |
| 14.29 | 0 |
| 14.3 | 0 |
| 14.31 | 0 |
| 14.32 | 0 |
| 14.33 | 0 |
| 14.34 | 0 |
| 14.35 | 0 |
| 14.36 | 0 |
| 14.37 | 0 |
| 14.38 | 0 |
| 14.39 | 0 |
| 14.4 | 0 |
| 14.41 | 0 |
| 14.42 | 0 |
| 14.43 | 0 |
| 14.44 | 0 |
| 14.45 | 0 |
| 14.46 | 0 |
| 14.47 | 0 |
| 14.48 | 0 |
| 14.49 | 0 |
| 14.5 | 0 |
| 14.51 | 0 |
| 14.52 | 0 |
| 14.53 | 0 |
| 14.54 | 0 |
| 14.55 | 0 |
| 14.56 | 0 |
| 14.57 | 0 |
| 14.58 | 0 |
| 14.59 | 0 |
| 14.6 | 0 |
| 14.61 | 0 |
| 14.62 | 0 |
| 14.63 | 0 |
| 14.64 | 0 |
| 14.65 | 0 |
| 14.66 | 0 |
| 14.67 | 0 |
| 14.68 | 0 |
| 14.69 | 0 |
| 14.7 | 0 |
| 14.71 | 0 |
| 14.72 | 0 |
| 14.73 | 0 |
| 14.74 | 0 |
| 14.75 | 0 |
| 14.76 | 0 |
| 14.77 | 0 |
| 14.78 | 0 |
| 14.79 | 0 |
| 14.8 | 0 |
| 14.81 | 0 |
| 14.82 | 0 |
| 14.83 | 0 |
| 14.84 | 0 |
| 14.85 | 0 |
| 14.86 | 0 |
| 14.87 | 0 |
| 14.88 | 0 |
| 14.89 | 0 |
| 14.9 | 0 |
| 14.91 | 0 |
| 14.92 | 0 |
| 14.93 | 0 |
| 14.94 | 0 |
| 14.95 | 0 |
| 14.96 | 0 |
| 14.97 | 0 |
| 14.98 | 0 |
| 14.99 | 0 |
| 15.0 | 0 |
| 15.01 | 0 |
| 15.02 | 0 |
| 15.03 | 0 |
| 15.04 | 0 |
| 15.05 | 0 |
| 15.06 | 0 |
| 15.07 | 0 |
| 15.08 | 0 |
| 15.09 | 0 |
| 15.1 | 0 |
| 15.11 | 0 |
| 15.12 | 0 |
| 15.13 | 0 |
| 15.14 | 0 |
| 15.15 | 0 |
| 15.16 | 0 |
| 15.17 | 0 |
| 15.18 | 0 |
| 15.19 | 0 |
| 15.2 | 0 |
| 15.21 | 0 |
| 15.22 | 0 |
| 15.23 | 0 |
| 15.24 | 0 |
| 15.25 | 0 |
| 15.26 | 0 |
| 15.27 | 0 |
| 15.28 | 0 |
| 15.29 | 0 |
| 15.3 | 0 |
| 15.31 | 0 |
| 15.32 | 0 |
| 15.33 | 0 |
| 15.34 | 0 |
| 15.35 | 0 |
| 15.36 | 0 |
| 15.37 | 0 |
| 15.38 | 0 |
| 15.39 | 0 |
| 15.4 | 0 |
| 15.41 | 0 |
| 15.42 | 0 |
| 15.43 | 0 |
| 15.44 | 0 |
| 15.45 | 0 |
| 15.46 | 0 |
| 15.47 | 0 |
| 15.48 | 0 |
| 15.49 | 0 |
| 15.5 | 0 |
| 15.51 | 0 |
| 15.52 | 0 |
| 15.53 | 0 |
| 15.54 | 0 |
| 15.55 | 0 |
| 15.56 | 0 |
| 15.57 | 0 |
| 15.58 | 0 |
| 15.59 | 0 |
| 15.6 | 0 |
| 15.61 | 0 |
| 15.62 | 0 |
| 15.63 | 0 |
| 15.64 | 0 |
| 15.65 | 0 |
| 15.66 | 0 |
| 15.67 | 0 |
| 15.68 | 0 |
| 15.69 | 0 |
| 15.7 | 0 |
| 15.71 | 0 |
| 15.72 | 0 |
| 15.73 | 0 |
| 15.74 | 0 |
| 15.75 | 0 |
| 15.76 | 0 |
| 15.77 | 0 |
| 15.78 | 0 |
| 15.79 | 0 |
| 15.8 | 0 |
| 15.81 | 0 |
| 15.82 | 0 |
| 15.83 | 0 |
| 15.84 | 0 |
| 15.85 | 0 |
| 15.86 | 0 |
| 15.87 | 0 |
| 15.88 | 0 |
| 15.89 | 0 |
| 15.9 | 0 |
| 15.91 | 0 |
| 15.92 | 0 |
| 15.93 | 0 |
| 15.94 | 0 |
| 15.95 | 0 |
| 15.96 | 0 |
| 15.97 | 0 |
| 15.98 | 0 |
| 15.99 | 0 |
| 16.0 | 0 |
| 16.01 | 0 |
| 16.02 | 0 |
| 16.03 | 0 |
| 16.04 | 0 |
| 16.05 | 0 |
| 16.06 | 0 |
| 16.07 | 0 |
| 16.08 | 0 |
| 16.09 | 0 |
| 16.1 | 0 |
| 16.11 | 0 |
| 16.12 | 0 |
| 16.13 | 0 |
| 16.14 | 0 |
| 16.15 | 0 |
| 16.16 | 0 |
| 16.17 | 0 |
| 16.18 | 0 |
| 16.19 | 0 |
| 16.2 | 0 |
| 16.21 | 0 |
| 16.22 | 0 |
| 16.23 | 0 |
| 16.24 | 0 |
| 16.25 | 0 |
| 16.26 | 0 |
| 16.27 | 0 |
| 16.28 | 0 |
| 16.29 | 0 |
| 16.3 | 0 |
| 16.31 | 0 |
| 16.32 | 0 |
| 16.33 | 0 |
| 16.34 | 0 |
| 16.35 | 0 |
| 16.36 | 0 |
| 16.37 | 0 |
| 16.38 | 0 |
| 16.39 | 0 |
| 16.4 | 0 |
| 16.41 | 0 |
| 16.42 | 0 |
| 16.43 | 0 |
| 16.44 | 0 |
| 16.45 | 0 |
| 16.46 | 0 |
| 16.47 | 0 |
| 16.48 | 0 |
| 16.49 | 0 |
| 16.5 | 0 |
| 16.51 | 0 |
| 16.52 | 0 |
| 16.53 | 0 |
| 16.54 | 0 |
| 16.55 | 0 |
| 16.56 | 0 |
| 16.57 | 0 |
| 16.58 | 0 |
| 16.59 | 0 |
| 16.6 | 0 |
| 16.61 | 0 |
| 16.62 | 0 |
| 16.63 | 0 |
| 16.64 | 0 |
| 16.65 | 0 |
| 16.66 | 0 |
| 16.67 | 0 |
| 16.68 | 0 |
| 16.69 | 0 |
| 16.7 | 0 |
| 16.71 | 0 |
| 16.72 | 0 |
| 16.73 | 0 |
| 16.74 | 0 |
| 16.75 | 0 |
| 16.76 | 0 |
| 16.77 | 0 |
| 16.78 | 0 |
| 16.79 | 0 |
| 16.8 | 0 |
| 16.81 | 0 |
| 16.82 | 0 |
| 16.83 | 0 |
| 16.84 | 0 |
| 16.85 | 0 |
| 16.86 | 0 |
| 16.87 | 0 |
| 16.88 | 0 |
| 16.89 | 0 |
| 16.9 | 0 |
| 16.91 | 0 |
| 16.92 | 0 |
| 16.93 | 0 |
| 16.94 | 0 |
| 16.95 | 0 |
| 16.96 | 0 |
| 16.97 | 0 |
| 16.98 | 0 |
| 16.99 | 0 |
| 17.0 | 0 |
| 17.01 | 0 |
| 17.02 | 0 |
| 17.03 | 0 |
| 17.04 | 0 |
| 17.05 | 0 |
| 17.06 | 0 |
| 17.07 | 0 |
| 17.08 | 0 |
| 17.09 | 0 |
| 17.1 | 0 |
| 17.11 | 0 |
| 17.12 | 0 |
| 17.13 | 0 |
| 17.14 | 0 |
| 17.15 | 0 |
| 17.16 | 0 |
| 17.17 | 0 |
| 17.18 | 0 |
| 17.19 | 0 |
| 17.2 | 0 |
| 17.21 | 0 |
| 17.22 | 0 |
| 17.23 | 0 |
| 17.24 | 0 |
| 17.25 | 0 |
| 17.26 | 0 |
| 17.27 | 0 |
| 17.28 | 0 |
| 17.29 | 0 |
| 17.3 | 0 |
| 17.31 | 0 |
| 17.32 | 0 |
| 17.33 | 0 |
| 17.34 | 0 |
| 17.35 | 0 |
| 17.36 | 0 |
| 17.37 | 0 |
| 17.38 | 0 |
| 17.39 | 0 |
| 17.4 | 0 |
| 17.41 | 0 |
| 17.42 | 0 |
| 17.43 | 0 |
| 17.44 | 0 |
| 17.45 | 0 |
| 17.46 | 0 |
| 17.47 | 0 |
| 17.48 | 0 |
| 17.49 | 0 |
| 17.5 | 0 |
| 17.51 | 0 |
| 17.52 | 0 |
| 17.53 | 0 |
| 17.54 | 0 |
| 17.55 | 0 |
| 17.56 | 0 |
| 17.57 | 0 |
| 17.58 | 0 |
| 17.59 | 0 |
| 17.6 | 0 |
| 17.61 | 0 |
| 17.62 | 0 |
| 17.63 | 0 |
| 17.64 | 0 |
| 17.65 | 0 |
| 17.66 | 0 |
| 17.67 | 0 |
| 17.68 | 0 |
| 17.69 | 0 |
| 17.7 | 0 |
| 17.71 | 0 |
| 17.72 | 0 |
| 17.73 | 0 |
| 17.74 | 0 |
| 17.75 | 0 |
| 17.76 | 0 |
| 17.77 | 0 |
| 17.78 | 0 |
| 17.79 | 0 |
| 17.8 | 0 |
| 17.81 | 0 |
| 17.82 | 0 |
| 17.83 | 0 |
| 17.84 | 0 |
| 17.85 | 0 |
| 17.86 | 0 |
| 17.87 | 0 |
| 17.88 | 0 |
| 17.89 | 0 |
| 17.9 | 0 |
| 17.91 | 0 |
| 17.92 | 0 |
| 17.93 | 0 |
| 17.94 | 0 |
| 17.95 | 0 |
| 17.96 | 0 |
| 17.97 | 0 |
| 17.98 | 0 |
| 17.99 | 0 |
| 18.0 | 0 |
| 18.01 | 0 |
| 18.02 | 0 |
| 18.03 | 0 |
| 18.04 | 0 |
| 18.05 | 0 |
| 18.06 | 0 |
| 18.07 | 0 |
| 18.08 | 0 |
| 18.09 | 0 |
| 18.1 | 0 |
| 18.11 | 0 |
| 18.12 | 0 |
| 18.13 | 0 |
| 18.14 | 0 |
| 18.15 | 0 |
| 18.16 | 0 |
| 18.17 | 0 |
| 18.18 | 0 |
| 18.19 | 0 |
| 18.2 | 0 |
| 18.21 | 0 |
| 18.22 | 0 |
| 18.23 | 0 |
| 18.24 | 0 |
| 18.25 | 0 |
| 18.26 | 0 |
| 18.27 | 0 |
| 18.28 | 0 |
| 18.29 | 0 |
| 18.3 | 0 |
| 18.31 | 0 |
| 18.32 | 0 |
| 18.33 | 0 |
| 18.34 | 0 |
| 18.35 | 0 |
| 18.36 | 0 |
| 18.37 | 0 |
| 18.38 | 0 |
| 18.39 | 0 |
| 18.4 | 0 |
| 18.41 | 0 |
| 18.42 | 0 |
| 18.43 | 0 |
| 18.44 | 0 |
| 18.45 | 0 |
| 18.46 | 0 |
| 18.47 | 0 |
| 18.48 | 0 |
| 18.49 | 0 |
| 18.5 | 0 |
| 18.51 | 0 |
| 18.52 | 0 |
| 18.53 | 0 |
| 18.54 | 0 |
| 18.55 | 0 |
| 18.56 | 0 |
| 18.57 | 0 |
| 18.58 | 0 |
| 18.59 | 0 |
| 18.6 | 0 |
| 18.61 | 0 |
| 18.62 | 0 |
| 18.63 | 0 |
| 18.64 | 0 |
| 18.65 | 0 |
| 18.66 | 0 |
| 18.67 | 0 |
| 18.68 | 0 |
| 18.69 | 0 |
| 18.7 | 0 |
| 18.71 | 0 |
| 18.72 | 0 |
| 18.73 | 0 |
| 18.74 | 0 |
| 18.75 | 0 |
| 18.76 | 0 |
| 18.77 | 0 |
| 18.78 | 0 |
| 18.79 | 0 |
| 18.8 | 0 |
| 18.81 | 0 |
| 18.82 | 0 |
| 18.83 | 0 |
| 18.84 | 0 |
| 18.85 | 0 |
| 18.86 | 0 |
| 18.87 | 0 |
| 18.88 | 0 |
| 18.89 | 0 |
| 18.9 | 0 |
| 18.91 | 0 |
| 18.92 | 0 |
| 18.93 | 0 |
| 18.94 | 0 |
| 18.95 | 0 |
| 18.96 | 0 |
| 18.97 | 0 |
| 18.98 | 0 |
| 18.99 | 0 |
| 19.0 | 0 |
| 19.01 | 0 |
| 19.02 | 0 |
| 19.03 | 0 |
| 19.04 | 0 |
| 19.05 | 0 |
| 19.06 | 0 |
| 19.07 | 0 |
| 19.08 | 0 |
| 19.09 | 0 |
| 19.1 | 0 |
| 19.11 | 0 |
| 19.12 | 0 |
| 19.13 | 0 |
| 19.14 | 0 |
| 19.15 | 0 |
| 19.16 | 0 |
| 19.17 | 0 |
| 19.18 | 0 |
| 19.19 | 0 |
| 19.2 | 0 |
| 19.21 | 0 |
| 19.22 | 0 |
| 19.23 | 0 |
| 19.24 | 0 |
| 19.25 | 0 |
| 19.26 | 0 |
| 19.27 | 0 |
| 19.28 | 0 |
| 19.29 | 0 |
| 19.3 | 0 |
| 19.31 | 0 |
| 19.32 | 0 |
| 19.33 | 0 |
| 19.34 | 0 |
| 19.35 | 0 |
| 19.36 | 0 |
| 19.37 | 0 |
| 19.38 | 0 |
| 19.39 | 0 |
| 19.4 | 0 |
| 19.41 | 0 |
| 19.42 | 0 |
| 19.43 | 0 |
| 19.44 | 0 |
| 19.45 | 0 |
| 19.46 | 0 |
| 19.47 | 0 |
| 19.48 | 0 |
| 19.49 | 0 |
| 19.5 | 0 |
| 19.51 | 0 |
| 19.52 | 0 |
| 19.53 | 0 |
| 19.54 | 0 |
| 19.55 | 0 |
| 19.56 | 0 |
| 19.57 | 0 |
| 19.58 | 0 |
| 19.59 | 0 |
| 19.6 | 0 |
| 19.61 | 0 |
| 19.62 | 0 |
| 19.63 | 0 |
| 19.64 | 0 |
| 19.65 | 0 |
| 19.66 | 0 |
| 19.67 | 0 |
| 19.68 | 0 |
| 19.69 | 0 |
| 19.7 | 0 |
| 19.71 | 0 |
| 19.72 | 0 |
| 19.73 | 0 |
| 19.74 | 0 |
| 19.75 | 0 |
| 19.76 | 0 |
| 19.77 | 0 |
| 19.78 | 0 |
| 19.79 | 0 |
| 19.8 | 0 |
| 19.81 | 0 |
| 19.82 | 0 |
| 19.83 | 0 |
| 19.84 | 0 |
| 19.85 | 0 |
| 19.86 | 0 |
| 19.87 | 0 |
| 19.88 | 0 |
| 19.89 | 0 |
| 19.9 | 0 |
| 19.91 | 0 |
| 19.92 | 0 |
| 19.93 | 0 |
| 19.94 | 0 |
| 19.95 | 0 |
| 19.96 | 0 |
| 19.97 | 0 |
| 19.98 | 0 |
| 19.99 | 0 |
| 20.0 | 0 |
| 20.01 | 0 |
| 20.02 | 0 |
| 20.03 | 0 |
| 20.04 | 0 |
| 20.05 | 0 |
| 20.06 | 0 |
| 20.07 | 0 |
| 20.08 | 0 |
| 20.09 | 0 |
| 20.1 | 0 |
| 20.11 | 0 |
| 20.12 | 0 |
| 20.13 | 0 |
| 20.14 | 0 |
| 20.15 | 0 |
| 20.16 | 0 |
| 20.17 | 0 |
| 20.18 | 0 |
| 20.19 | 0 |
| 20.2 | 0 |
| 20.21 | 0 |
| 20.22 | 0 |
| 20.23 | 0 |
| 20.24 | 0 |
| 20.25 | 0 |
| 20.26 | 0 |
| 20.27 | 0 |
| 20.28 | 0 |
| 20.29 | 0 |
| 20.3 | 0 |
| 20.31 | 0 |
| 20.32 | 0 |
| 20.33 | 0 |
| 20.34 | 0 |
| 20.35 | 0 |
| 20.36 | 0 |
| 20.37 | 0 |
| 20.38 | 0 |
| 20.39 | 0 |
| 20.4 | 0 |
| 20.41 | 0 |
| 20.42 | 0 |
| 20.43 | 0 |
| 20.44 | 0 |
| 20.45 | 0 |
| 20.46 | 0 |
| 20.47 | 0 |
| 20.48 | 0 |
| 20.49 | 0 |
| 20.5 | 0 |
| 20.51 | 0 |
| 20.52 | 0 |
| 20.53 | 0 |
| 20.54 | 0 |
| 20.55 | 0 |
| 20.56 | 0 |
| 20.57 | 0 |
| 20.58 | 0 |
| 20.59 | 0 |
| 20.6 | 0 |
| 20.61 | 0 |
| 20.62 | 0 |
| 20.63 | 0 |
| 20.64 | 0 |
| 20.65 | 0 |
| 20.66 | 0 |
| 20.67 | 0 |
| 20.68 | 0 |
| 20.69 | 0 |
| 20.7 | 0 |
| 20.71 | 0 |
| 20.72 | 0 |
| 20.73 | 0 |
| 20.74 | 0 |
| 20.75 | 0 |
| 20.76 | 0 |
| 20.77 | 0 |
| 20.78 | 0 |
| 20.79 | 0 |
| 20.8 | 0 |
| 20.81 | 0 |
| 20.82 | 0 |
| 20.83 | 0 |
| 20.84 | 0 |
| 20.85 | 0 |
| 20.86 | 0 |
| 20.87 | 0 |
| 20.88 | 0 |
| 20.89 | 0 |
| 20.9 | 0 |
| 20.91 | 0 |
| 20.92 | 0 |
| 20.93 | 0 |
| 20.94 | 0 |
| 20.95 | 0 |
| 20.96 | 0 |
| 20.97 | 0 |
| 20.98 | 0 |
| 20.99 | 0 |
| 21.0 | 0 |
| 21.01 | 0 |
| 21.02 | 0 |
| 21.03 | 0 |
| 21.04 | 0 |
| 21.05 | 0 |
| 21.06 | 0 |
| 21.07 | 0 |
| 21.08 | 0 |
| 21.09 | 0 |
| 21.1 | 0 |
| 21.11 | 0 |
| 21.12 | 0 |
| 21.13 | 0 |
| 21.14 | 0 |
| 21.15 | 0 |
| 21.16 | 0 |
| 21.17 | 0 |
| 21.18 | 0 |
| 21.19 | 0 |
| 21.2 | 0 |
| 21.21 | 0 |
| 21.22 | 0 |
| 21.23 | 0 |
| 21.24 | 0 |
| 21.25 | 0 |
| 21.26 | 0 |
| 21.27 | 0 |
| 21.28 | 0 |
| 21.29 | 0 |
| 21.3 | 0 |
| 21.31 | 0 |
| 21.32 | 0 |
| 21.33 | 0 |
| 21.34 | 0 |
| 21.35 | 0 |
| 21.36 | 0 |
| 21.37 | 0 |
| 21.38 | 0 |
| 21.39 | 0 |
| 21.4 | 0 |
| 21.41 | 0 |
| 21.42 | 0 |
| 21.43 | 0 |
| 21.44 | 0 |
| 21.45 | 0 |
| 21.46 | 0 |
| 21.47 | 0 |
| 21.48 | 0 |
| 21.49 | 0 |
| 21.5 | 0 |
| 21.51 | 0 |
| 21.52 | 0 |
| 21.53 | 0 |
| 21.54 | 0 |
| 21.55 | 0 |
| 21.56 | 0 |
| 21.57 | 0 |
| 21.58 | 0 |
| 21.59 | 0 |
| 21.6 | 0 |
| 21.61 | 0 |
| 21.62 | 0 |
| 21.63 | 0 |
| 21.64 | 0 |
| 21.65 | 0 |
| 21.66 | 0 |
| 21.67 | 0 |
| 21.68 | 0 |
| 21.69 | 0 |
| 21.7 | 0 |
| 21.71 | 0 |
| 21.72 | 0 |
| 21.73 | 0 |
| 21.74 | 0 |
| 21.75 | 0 |
| 21.76 | 0 |
| 21.77 | 0 |
| 21.78 | 0 |
| 21.79 | 0 |
| 21.8 | 0 |
| 21.81 | 0 |
| 21.82 | 0 |
| 21.83 | 0 |
| 21.84 | 0 |
| 21.85 | 0 |
| 21.86 | 0 |
| 21.87 | 0 |
| 21.88 | 0 |
| 21.89 | 0 |
| 21.9 | 0 |
| 21.91 | 0 |
| 21.92 | 0 |
| 21.93 | 0 |
| 21.94 | 0 |
| 21.95 | 0 |
| 21.96 | 0 |
| 21.97 | 0 |
| 21.98 | 0 |
| 21.99 | 0 |
| 22.0 | 0 |
| 22.01 | 0 |
| 22.02 | 0 |
| 22.03 | 0 |
| 22.04 | 0 |
| 22.05 | 0 |
| 22.06 | 0 |
| 22.07 | 0 |
| 22.08 | 0 |
| 22.09 | 0 |
| 22.1 | 0 |
| 22.11 | 0 |
| 22.12 | 0 |
| 22.13 | 0 |
| 22.14 | 0 |
| 22.15 | 0 |
| 22.16 | 0 |
| 22.17 | 0 |
| 22.18 | 0 |
| 22.19 | 0 |
| 22.2 | 0 |
| 22.21 | 0 |
| 22.22 | 0 |
| 22.23 | 0 |
| 22.24 | 0 |
| 22.25 | 0 |
| 22.26 | 0 |
| 22.27 | 0 |
| 22.28 | 0 |
| 22.29 | 0 |
| 22.3 | 0 |
| 22.31 | 0 |
| 22.32 | 0 |
| 22.33 | 0 |
| 22.34 | 0 |
| 22.35 | 0 |
| 22.36 | 0 |
| 22.37 | 0 |
| 22.38 | 0 |
| 22.39 | 0 |
| 22.4 | 0 |
| 22.41 | 0 |
| 22.42 | 0 |
| 22.43 | 0 |
| 22.44 | 0 |
| 22.45 | 0 |
| 22.46 | 0 |
| 22.47 | 0 |
| 22.48 | 0 |
| 22.49 | 0 |
| 22.5 | 0 |
| 22.51 | 0 |
| 22.52 | 0 |
| 22.53 | 0 |
| 22.54 | 0 |
| 22.55 | 0 |
| 22.56 | 0 |
| 22.57 | 0 |
| 22.58 | 0 |
| 22.59 | 0 |
| 22.6 | 0 |
| 22.61 | 0 |
| 22.62 | 0 |
| 22.63 | 0 |
| 22.64 | 0 |
| 22.65 | 0 |
| 22.66 | 0 |
| 22.67 | 0 |
| 22.68 | 0 |
| 22.69 | 0 |
| 22.7 | 0 |
| 22.71 | 0 |
| 22.72 | 0 |
| 22.73 | 0 |
| 22.74 | 0 |
| 22.75 | 0 |
| 22.76 | 0 |
| 22.77 | 0 |
| 22.78 | 0 |
| 22.79 | 0 |
| 22.8 | 0 |
| 22.81 | 0 |
| 22.82 | 0 |
| 22.83 | 0 |
| 22.84 | 0 |
| 22.85 | 0 |
| 22.86 | 0 |
| 22.87 | 0 |
| 22.88 | 0 |
| 22.89 | 0 |
| 22.9 | 0 |
| 22.91 | 0 |
| 22.92 | 0 |
| 22.93 | 0 |
| 22.94 | 0 |
| 22.95 | 0 |
| 22.96 | 0 |
| 22.97 | 0 |
| 22.98 | 0 |
| 22.99 | 0 |
| 23.0 | 0 |
| 23.01 | 0 |
| 23.02 | 0 |
| 23.03 | 0 |
| 23.04 | 0 |
| 23.05 | 0 |
| 23.06 | 0 |
| 23.07 | 0 |
| 23.08 | 0 |
| 23.09 | 0 |
| 23.1 | 0 |
| 23.11 | 0 |
| 23.12 | 0 |
| 23.13 | 0 |
| 23.14 | 0 |
| 23.15 | 0 |
| 23.16 | 0 |
| 23.17 | 0 |
| 23.18 | 0 |
| 23.19 | 0 |
| 23.2 | 0 |
| 23.21 | 0 |
| 23.22 | 0 |
| 23.23 | 0 |
| 23.24 | 0 |
| 23.25 | 0 |
| 23.26 | 0 |
| 23.27 | 0 |
| 23.28 | 0 |
| 23.29 | 0 |
| 23.3 | 0 |
| 23.31 | 0 |
| 23.32 | 0 |
| 23.33 | 0 |
| 23.34 | 0 |
| 23.35 | 0 |
| 23.36 | 0 |
| 23.37 | 0 |
| 23.38 | 0 |
| 23.39 | 0 |
| 23.4 | 0 |
| 23.41 | 0 |
| 23.42 | 0 |
| 23.43 | 0 |
| 23.44 | 0 |
| 23.45 | 0 |
| 23.46 | 0 |
| 23.47 | 0 |
| 23.48 | 0 |
| 23.49 | 0 |
| 23.5 | 0 |
| 23.51 | 0 |
| 23.52 | 0 |
| 23.53 | 0 |
| 23.54 | 0 |
| 23.55 | 0 |
| 23.56 | 0 |
| 23.57 | 0 |
| 23.58 | 0 |
| 23.59 | 0 |
| 23.6 | 0 |
| 23.61 | 0 |
| 23.62 | 0 |
| 23.63 | 0 |
| 23.64 | 0 |
| 23.65 | 0 |
| 23.66 | 0 |
| 23.67 | 0 |
| 23.68 | 0 |
| 23.69 | 0 |
| 23.7 | 0 |
| 23.71 | 0 |
| 23.72 | 0 |
| 23.73 | 0 |
| 23.74 | 0 |
| 23.75 | 0 |
| 23.76 | 0 |
| 23.77 | 0 |
| 23.78 | 0 |
| 23.79 | 0 |
| 23.8 | 0 |
| 23.81 | 0 |
| 23.82 | 0 |
| 23.83 | 0 |
| 23.84 | 0 |
| 23.85 | 0 |
| 23.86 | 0 |
| 23.87 | 0 |
| 23.88 | 0 |
| 23.89 | 0 |
| 23.9 | 0 |
| 23.91 | 0 |
| 23.92 | 0 |
| 23.93 | 0 |
| 23.94 | 0 |
| 23.95 | 0 |
| 23.96 | 0 |
| 23.97 | 0 |
| 23.98 | 0 |
| 23.99 | 0 |
| 24.0 | 0 |
| 24.01 | 0 |
| 24.02 | 0 |
| 24.03 | 0 |
| 24.04 | 0 |
| 24.05 | 0 |
| 24.06 | 0 |
| 24.07 | 0 |
| 24.08 | 0 |
| 24.09 | 0 |
| 24.1 | 0 |
| 24.11 | 0 |
| 24.12 | 0 |
| 24.13 | 0 |
| 24.14 | 0 |
| 24.15 | 0 |
| 24.16 | 0 |
| 24.17 | 0 |
| 24.18 | 0 |
| 24.19 | 0 |
| 24.2 | 0 |
| 24.21 | 0 |
| 24.22 | 0 |
| 24.23 | 0 |
| 24.24 | 0 |
| 24.25 | 0 |
| 24.26 | 0 |
| 24.27 | 0 |
| 24.28 | 0 |
| 24.29 | 0 |
| 24.3 | 0 |
| 24.31 | 0 |
| 24.32 | 0 |
| 24.33 | 0 |
| 24.34 | 0 |
| 24.35 | 0 |
| 24.36 | 0 |
| 24.37 | 0 |
| 24.38 | 0 |
| 24.39 | 0 |
| 24.4 | 0 |
| 24.41 | 0 |
| 24.42 | 0 |
| 24.43 | 0 |
| 24.44 | 0 |
| 24.45 | 0 |
| 24.46 | 0 |
| 24.47 | 0 |
| 24.48 | 0 |
| 24.49 | 0 |
| 24.5 | 0 |
| 24.51 | 0 |
| 24.52 | 0 |
| 24.53 | 0 |
| 24.54 | 0 |
| 24.55 | 0 |
| 24.56 | 0 |
| 24.57 | 0 |
| 24.58 | 0 |
| 24.59 | 0 |
| 24.6 | 0 |
| 24.61 | 0 |
| 24.62 | 0 |
| 24.63 | 0 |
| 24.64 | 0 |
| 24.65 | 0 |
| 24.66 | 0 |
| 24.67 | 0 |
| 24.68 | 0 |
| 24.69 | 0 |
| 24.7 | 0 |
| 24.71 | 0 |
| 24.72 | 0 |
| 24.73 | 0 |
| 24.74 | 0 |
| 24.75 | 0 |
| 24.76 | 0 |
| 24.77 | 0 |
| 24.78 | 0 |
| 24.79 | 0 |
| 24.8 | 0 |
| 24.81 | 0 |
| 24.82 | 0 |
| 24.83 | 0 |
| 24.84 | 0 |
| 24.85 | 0 |
| 24.86 | 0 |
| 24.87 | 0 |
| 24.88 | 0 |
| 24.89 | 0 |
| 24.9 | 0 |
| 24.91 | 0 |
| 24.92 | 0 |
| 24.93 | 0 |
| 24.94 | 0 |
| 24.95 | 0 |
| 24.96 | 0 |
| 24.97 | 0 |
| 24.98 | 0 |
| 24.99 | 0 |
| 25.0 | 0 |
| 25.01 | 0 |
| 25.02 | 0 |
| 25.03 | 0 |
| 25.04 | 0 |
| 25.05 | 0 |
| 25.06 | 0 |
| 25.07 | 0 |
| 25.08 | 0 |
| 25.09 | 0 |
| 25.1 | 0 |
| 25.11 | 0 |
| 25.12 | 0 |
| 25.13 | 0 |
| 25.14 | 0 |
| 25.15 | 0 |
| 25.16 | 0 |
| 25.17 | 0 |
| 25.18 | 0 |
| 25.19 | 0 |
| 25.2 | 0 |
| 25.21 | 0 |
| 25.22 | 0 |
| 25.23 | 0 |
| 25.24 | 0 |
| 25.25 | 0 |
| 25.26 | 0 |
| 25.27 | 0 |
| 25.28 | 0 |
| 25.29 | 0 |
| 25.3 | 0 |
| 25.31 | 0 |
| 25.32 | 0 |
| 25.33 | 0 |
| 25.34 | 0 |
| 25.35 | 0 |
| 25.36 | 0 |
| 25.37 | 0 |
| 25.38 | 0 |
| 25.39 | 0 |
| 25.4 | 0 |
| 25.41 | 0 |
| 25.42 | 0 |
| 25.43 | 0 |
| 25.44 | 0 |
| 25.45 | 0 |
| 25.46 | 0 |
| 25.47 | 0 |
| 25.48 | 0 |
| 25.49 | 0 |
| 25.5 | 0 |
| 25.51 | 0 |
| 25.52 | 0 |
| 25.53 | 0 |
| 25.54 | 0 |
| 25.55 | 0 |
| 25.56 | 0 |
| 25.57 | 0 |
| 25.58 | 0 |
| 25.59 | 0 |
| 25.6 | 0 |
| 25.61 | 0 |
| 25.62 | 0 |
| 25.63 | 0 |
| 25.64 | 0 |
| 25.65 | 0 |
| 25.66 | 0 |
| 25.67 | 0 |
| 25.68 | 0 |
| 25.69 | 0 |
| 25.7 | 0 |
| 25.71 | 0 |
| 25.72 | 0 |
| 25.73 | 0 |
| 25.74 | 0 |
| 25.75 | 0 |
| 25.76 | 0 |
| 25.77 | 0 |
| 25.78 | 0 |
| 25.79 | 0 |
| 25.8 | 0 |
| 25.81 | 0 |
| 25.82 | 0 |
| 25.83 | 0 |
| 25.84 | 0 |
| 25.85 | 0 |
| 25.86 | 0 |
| 25.87 | 0 |
| 25.88 | 0 |
| 25.89 | 0 |
| 25.9 | 0 |
| 25.91 | 0 |
| 25.92 | 0 |
| 25.93 | 0 |
| 25.94 | 0 |
| 25.95 | 0 |
| 25.96 | 0 |
| 25.97 | 0 |
| 25.98 | 0 |
| 25.99 | 0 |
| 26.0 | 0 |
| 26.01 | 0 |
| 26.02 | 0 |
| 26.03 | 0 |
| 26.04 | 0 |
| 26.05 | 0 |
| 26.06 | 0 |
| 26.07 | 0 |
| 26.08 | 0 |
| 26.09 | 0 |
| 26.1 | 0 |
| 26.11 | 0 |
| 26.12 | 0 |
| 26.13 | 0 |
| 26.14 | 0 |
| 26.15 | 0 |
| 26.16 | 0 |
| 26.17 | 0 |
| 26.18 | 0 |
| 26.19 | 0 |
| 26.2 | 0 |
| 26.21 | 0 |
| 26.22 | 0 |
| 26.23 | 0 |
| 26.24 | 0 |
| 26.25 | 0 |
| 26.26 | 0 |
| 26.27 | 0 |
| 26.28 | 0 |
| 26.29 | 0 |
| 26.3 | 0 |
| 26.31 | 0 |
| 26.32 | 0 |
| 26.33 | 0 |
| 26.34 | 0 |
| 26.35 | 0 |
| 26.36 | 0 |
| 26.37 | 0 |
| 26.38 | 0 |
| 26.39 | 0 |
| 26.4 | 0 |
| 26.41 | 0 |
| 26.42 | 0 |
| 26.43 | 0 |
| 26.44 | 0 |
| 26.45 | 0 |
| 26.46 | 0 |
| 26.47 | 0 |
| 26.48 | 0 |
| 26.49 | 0 |
| 26.5 | 0 |
| 26.51 | 0 |
| 26.52 | 0 |
| 26.53 | 0 |
| 26.54 | 0 |
| 26.55 | 0 |
| 26.56 | 0 |
| 26.57 | 0 |
| 26.58 | 0 |
| 26.59 | 0 |
| 26.6 | 0 |
| 26.61 | 0 |
| 26.62 | 0 |
| 26.63 | 0 |
| 26.64 | 0 |
| 26.65 | 0 |
| 26.66 | 0 |
| 26.67 | 0 |
| 26.68 | 0 |
| 26.69 | 0 |
| 26.7 | 0 |
| 26.71 | 0 |
| 26.72 | 0 |
| 26.73 | 0 |
| 26.74 | 0 |
| 26.75 | 0 |
| 26.76 | 0 |
| 26.77 | 0 |
| 26.78 | 0 |
| 26.79 | 0 |
| 26.8 | 0 |
| 26.81 | 0 |
| 26.82 | 0 |
| 26.83 | 0 |
| 26.84 | 0 |
| 26.85 | 0 |
| 26.86 | 0 |
| 26.87 | 0 |
| 26.88 | 0 |
| 26.89 | 0 |
| 26.9 | 0 |
| 26.91 | 0 |
| 26.92 | 0 |
| 26.93 | 0 |
| 26.94 | 0 |
| 26.95 | 0 |
| 26.96 | 0 |
| 26.97 | 0 |
| 26.98 | 0 |
| 26.99 | 0 |
| 27.0 | 0 |
| 27.01 | 0 |
| 27.02 | 0 |
| 27.03 | 0 |
| 27.04 | 0 |
| 27.05 | 0 |
| 27.06 | 0 |
| 27.07 | 0 |
| 27.08 | 0 |
| 27.09 | 0 |
| 27.1 | 0 |
| 27.11 | 0 |
| 27.12 | 0 |
| 27.13 | 0 |
| 27.14 | 0 |
| 27.15 | 0 |
| 27.16 | 0 |
| 27.17 | 0 |
| 27.18 | 0 |
| 27.19 | 0 |
| 27.2 | 0 |
| 27.21 | 0 |
| 27.22 | 0 |
| 27.23 | 0 |
| 27.24 | 0 |
| 27.25 | 0 |
| 27.26 | 0 |
| 27.27 | 0 |
| 27.28 | 0 |
| 27.29 | 0 |
| 27.3 | 0 |
| 27.31 | 0 |
| 27.32 | 0 |
| 27.33 | 0 |
| 27.34 | 0 |
| 27.35 | 0 |
| 27.36 | 0 |
| 27.37 | 0 |
| 27.38 | 0 |
| 27.39 | 0 |
| 27.4 | 0 |
| 27.41 | 0 |
| 27.42 | 0 |
| 27.43 | 0 |
| 27.44 | 0 |
| 27.45 | 0 |
| 27.46 | 0 |
| 27.47 | 0 |
| 27.48 | 0 |
| 27.49 | 0 |
| 27.5 | 0 |
| 27.51 | 0 |
| 27.52 | 0 |
| 27.53 | 0 |
| 27.54 | 0 |
| 27.55 | 0 |
| 27.56 | 0 |
| 27.57 | 0 |
| 27.58 | 0 |
| 27.59 | 0 |
| 27.6 | 0 |
| 27.61 | 0 |
| 27.62 | 0 |
| 27.63 | 0 |
| 27.64 | 0 |
| 27.65 | 0 |
| 27.66 | 0 |
| 27.67 | 0 |
| 27.68 | 0 |
| 27.69 | 0 |
| 27.7 | 0 |
| 27.71 | 0 |
| 27.72 | 0 |
| 27.73 | 0 |
| 27.74 | 0 |
| 27.75 | 0 |
| 27.76 | 0 |
| 27.77 | 0 |
| 27.78 | 0 |
| 27.79 | 0 |
| 27.8 | 0 |
| 27.81 | 0 |
| 27.82 | 0 |
| 27.83 | 0 |
| 27.84 | 0 |
| 27.85 | 0 |
| 27.86 | 0 |
| 27.87 | 0 |
| 27.88 | 0 |
| 27.89 | 0 |
| 27.9 | 0 |
| 27.91 | 0 |
| 27.92 | 0 |
| 27.93 | 0 |
| 27.94 | 0 |
| 27.95 | 0 |
| 27.96 | 0 |
| 27.97 | 0 |
| 27.98 | 0 |
| 27.99 | 0 |
| 28.0 | 0 |
| 28.01 | 0 |
| 28.02 | 0 |
| 28.03 | 0 |
| 28.04 | 0 |
| 28.05 | 0 |
| 28.06 | 0 |
| 28.07 | 0 |
| 28.08 | 0 |
| 28.09 | 0 |
| 28.1 | 0 |
| 28.11 | 0 |
| 28.12 | 0 |
| 28.13 | 0 |
| 28.14 | 0 |
| 28.15 | 0 |
| 28.16 | 0 |
| 28.17 | 0 |
| 28.18 | 0 |
| 28.19 | 0 |
| 28.2 | 0 |
| 28.21 | 0 |
| 28.22 | 0 |
| 28.23 | 0 |
| 28.24 | 0 |
| 28.25 | 0 |
| 28.26 | 0 |
| 28.27 | 0 |
| 28.28 | 0 |
| 28.29 | 0 |
| 28.3 | 0 |
| 28.31 | 0 |
| 28.32 | 0 |
| 28.33 | 0 |
| 28.34 | 0 |
| 28.35 | 0 |
| 28.36 | 0 |
| 28.37 | 0 |
| 28.38 | 0 |
| 28.39 | 0 |
| 28.4 | 0 |
| 28.41 | 0 |
| 28.42 | 0 |
| 28.43 | 0 |
| 28.44 | 0 |
| 28.45 | 0 |
| 28.46 | 0 |
| 28.47 | 0 |
| 28.48 | 0 |
| 28.49 | 0 |
| 28.5 | 0 |
| 28.51 | 0 |
| 28.52 | 0 |
| 28.53 | 0 |
| 28.54 | 0 |
| 28.55 | 0 |
| 28.56 | 0 |
| 28.57 | 0 |
| 28.58 | 0 |
| 28.59 | 0 |
| 28.6 | 0 |
| 28.61 | 0 |
| 28.62 | 0 |
| 28.63 | 0 |
| 28.64 | 0 |
| 28.65 | 0 |
| 28.66 | 0 |
| 28.67 | 0 |
| 28.68 | 0 |
| 28.69 | 0 |
| 28.7 | 0 |
| 28.71 | 0 |
| 28.72 | 0 |
| 28.73 | 0 |
| 28.74 | 0 |
| 28.75 | 0 |
| 28.76 | 0 |
| 28.77 | 0 |
| 28.78 | 0 |
| 28.79 | 0 |
| 28.8 | 0 |
| 28.81 | 0 |
| 28.82 | 0 |
| 28.83 | 0 |
| 28.84 | 0 |
| 28.85 | 0 |
| 28.86 | 0 |
| 28.87 | 0 |
| 28.88 | 0 |
| 28.89 | 0 |
| 28.9 | 0 |
| 28.91 | 0 |
| 28.92 | 0 |
| 28.93 | 0 |
| 28.94 | 0 |
| 28.95 | 0 |
| 28.96 | 0 |
| 28.97 | 0 |
| 28.98 | 0 |
| 28.99 | 0 |
| 29.0 | 0 |
| 29.01 | 0 |
| 29.02 | 0 |
| 29.03 | 0 |
| 29.04 | 0 |
| 29.05 | 0 |
| 29.06 | 0 |
| 29.07 | 0 |
| 29.08 | 0 |
| 29.09 | 0 |
| 29.1 | 0 |
| 29.11 | 0 |
| 29.12 | 0 |
| 29.13 | 0 |
| 29.14 | 0 |
| 29.15 | 0 |
| 29.16 | 0 |
| 29.17 | 0 |
| 29.18 | 0 |
| 29.19 | 0 |
| 29.2 | 0 |
| 29.21 | 0 |
| 29.22 | 0 |
| 29.23 | 0 |
| 29.24 | 0 |
| 29.25 | 0 |
| 29.26 | 0 |
| 29.27 | 0 |
| 29.28 | 0 |
| 29.29 | 0 |
| 29.3 | 0 |
| 29.31 | 0 |
| 29.32 | 0 |
| 29.33 | 0 |
| 29.34 | 0 |
| 29.35 | 0 |
| 29.36 | 0 |
| 29.37 | 0 |
| 29.38 | 0 |
| 29.39 | 0 |
| 29.4 | 0 |
| 29.41 | 0 |
| 29.42 | 0 |
| 29.43 | 0 |
| 29.44 | 0 |
| 29.45 | 0 |
| 29.46 | 0 |
| 29.47 | 0 |
| 29.48 | 0 |
| 29.49 | 0 |
| 29.5 | 0 |
| 29.51 | 0 |
| 29.52 | 0 |
| 29.53 | 0 |
| 29.54 | 0 |
| 29.55 | 0 |
| 29.56 | 0 |
| 29.57 | 0 |
| 29.58 | 0 |
| 29.59 | 0 |
| 29.6 | 0 |
| 29.61 | 0 |
| 29.62 | 0 |
| 29.63 | 0 |
| 29.64 | 0 |
| 29.65 | 0 |
| 29.66 | 0 |
| 29.67 | 0 |
| 29.68 | 0 |
| 29.69 | 0 |
| 29.7 | 0 |
| 29.71 | 0 |
| 29.72 | 0 |
| 29.73 | 0 |
| 29.74 | 0 |
| 29.75 | 0 |
| 29.76 | 0 |
| 29.77 | 0 |
| 29.78 | 0 |
| 29.79 | 0 |
| 29.8 | 0 |
| 29.81 | 0 |
| 29.82 | 0 |
| 29.83 | 0 |
| 29.84 | 0 |
| 29.85 | 0 |
| 29.86 | 0 |
| 29.87 | 0 |
| 29.88 | 0 |
| 29.89 | 0 |
| 29.9 | 0 |
| 29.91 | 0 |
| 29.92 | 0 |
| 29.93 | 0 |
| 29.94 | 0 |
| 29.95 | 0 |
| 29.96 | 0 |
| 29.97 | 0 |
| 29.98 | 0 |
| 29.99 | 0 |
| 30.0 | 0 |
| 30.01 | 0 |
| 30.02 | 0 |
| 30.03 | 0 |
| 30.04 | 0 |
| 30.05 | 0 |
| 30.06 | 0 |
| 30.07 | 0 |
| 30.08 | 0 |
| 30.09 | 0 |
| 30.1 | 0 |
| 30.11 | 0 |
| 30.12 | 0 |
| 30.13 | 0 |
| 30.14 | 0 |
| 30.15 | 0 |
| 30.16 | 0 |
| 30.17 | 0 |
| 30.18 | 0 |
| 30.19 | 0 |
| 30.2 | 0 |
| 30.21 | 0 |
| 30.22 | 0 |
| 30.23 | 0 |
| 30.24 | 0 |
| 30.25 | 0 |
| 30.26 | 0 |
| 30.27 | 0 |
| 30.28 | 0 |
| 30.29 | 0 |
| 30.3 | 0 |
| 30.31 | 0 |
| 30.32 | 0 |
| 30.33 | 0 |
| 30.34 | 0 |
| 30.35 | 0 |
| 30.36 | 0 |
| 30.37 | 0 |
| 30.38 | 0 |
| 30.39 | 0 |
| 30.4 | 0 |
| 30.41 | 0 |
| 30.42 | 0 |
| 30.43 | 0 |
| 30.44 | 0 |
| 30.45 | 0 |
| 30.46 | 0 |
| 30.47 | 0 |
| 30.48 | 0 |
| 30.49 | 0 |
| 30.5 | 0 |
| 30.51 | 0 |
| 30.52 | 0 |
| 30.53 | 0 |
| 30.54 | 0 |
| 30.55 | 0 |
| 30.56 | 0 |
| 30.57 | 0 |
| 30.58 | 0 |
| 30.59 | 0 |
| 30.6 | 0 |
| 30.61 | 0 |
| 30.62 | 0 |
| 30.63 | 0 |
| 30.64 | 0 |
| 30.65 | 0 |
| 30.66 | 0 |
| 30.67 | 0 |
| 30.68 | 0 |
| 30.69 | 0 |
| 30.7 | 0 |
| 30.71 | 0 |
| 30.72 | 0 |
| 30.73 | 0 |
| 30.74 | 0 |
| 30.75 | 0 |
| 30.76 | 0 |
| 30.77 | 0 |
| 30.78 | 0 |
| 30.79 | 0 |
| 30.8 | 0 |
| 30.81 | 0 |
| 30.82 | 0 |
| 30.83 | 0 |
| 30.84 | 0 |
| 30.85 | 0 |
| 30.86 | 0 |
| 30.87 | 0 |
| 30.88 | 0 |
| 30.89 | 0 |
| 30.9 | 0 |
| 30.91 | 0 |
| 30.92 | 0 |
| 30.93 | 0 |
| 30.94 | 0 |
| 30.95 | 0 |
| 30.96 | 0 |
| 30.97 | 0 |
| 30.98 | 0 |
| 30.99 | 0 |
| 31.0 | 0 |
| 31.01 | 0 |
| 31.02 | 0 |
| 31.03 | 0 |
| 31.04 | 0 |
| 31.05 | 0 |
| 31.06 | 0 |
| 31.07 | 0 |
| 31.08 | 0 |
| 31.09 | 0 |
| 31.1 | 0 |
| 31.11 | 0 |
| 31.12 | 0 |
| 31.13 | 0 |
| 31.14 | 0 |
| 31.15 | 0 |
| 31.16 | 0 |
| 31.17 | 0 |
| 31.18 | 0 |
| 31.19 | 0 |
| 31.2 | 0 |
| 31.21 | 0 |
| 31.22 | 0 |
| 31.23 | 0 |
| 31.24 | 0 |
| 31.25 | 0 |
| 31.26 | 0 |
| 31.27 | 0 |
| 31.28 | 0 |
| 31.29 | 0 |
| 31.3 | 0 |
| 31.31 | 0 |
| 31.32 | 0 |
| 31.33 | 0 |
| 31.34 | 0 |
| 31.35 | 0 |
| 31.36 | 0 |
| 31.37 | 0 |
| 31.38 | 0 |
| 31.39 | 0 |
| 31.4 | 0 |
| 31.41 | 0 |
| 31.42 | 0 |
| 31.43 | 0 |
| 31.44 | 0 |
| 31.45 | 0 |
| 31.46 | 0 |
| 31.47 | 0 |
| 31.48 | 0 |
| 31.49 | 0 |
| 31.5 | 0 |
| 31.51 | 0 |
| 31.52 | 0 |
| 31.53 | 0 |
| 31.54 | 0 |
| 31.55 | 0 |
| 31.56 | 0 |
| 31.57 | 0 |
| 31.58 | 0 |
| 31.59 | 0 |
| 31.6 | 0 |
| 31.61 | 0 |
| 31.62 | 0 |
| 31.63 | 0 |
| 31.64 | 0 |
| 31.65 | 0 |
| 31.66 | 0 |
| 31.67 | 0 |
| 31.68 | 0 |
| 31.69 | 0 |
| 31.7 | 0 |
| 31.71 | 0 |
| 31.72 | 0 |
| 31.73 | 0 |
| 31.74 | 0 |
| 31.75 | 0 |
| 31.76 | 0 |
| 31.77 | 0 |
| 31.78 | 0 |
| 31.79 | 0 |
| 31.8 | 0 |
| 31.81 | 0 |
| 31.82 | 0 |
| 31.83 | 0 |
| 31.84 | 0 |
| 31.85 | 0 |
| 31.86 | 0 |
| 31.87 | 0 |
| 31.88 | 0 |
| 31.89 | 0 |
| 31.9 | 0 |
| 31.91 | 0 |
| 31.92 | 0 |
| 31.93 | 0 |
| 31.94 | 0 |
| 31.95 | 0 |
| 31.96 | 0 |
| 31.97 | 0 |
| 31.98 | 0 |
| 31.99 | 0 |
| 32.0 | 0 |
| 32.01 | 0 |
| 32.02 | 0 |
| 32.03 | 0 |
| 32.04 | 0 |
| 32.05 | 0 |
| 32.06 | 0 |
| 32.07 | 0 |
| 32.08 | 0 |
| 32.09 | 0 |
| 32.1 | 0 |
| 32.11 | 0 |
| 32.12 | 0 |
| 32.13 | 0 |
| 32.14 | 0 |
| 32.15 | 0 |
| 32.16 | 0 |
| 32.17 | 0 |
| 32.18 | 0 |
| 32.19 | 0 |
| 32.2 | 0 |
| 32.21 | 0 |
| 32.22 | 0 |
| 32.23 | 0 |
| 32.24 | 0 |
| 32.25 | 0 |
| 32.26 | 0 |
| 32.27 | 0 |
| 32.28 | 0 |
| 32.29 | 0 |
| 32.3 | 0 |
| 32.31 | 0 |
| 32.32 | 0 |
| 32.33 | 0 |
| 32.34 | 0 |
| 32.35 | 0 |
| 32.36 | 0 |
| 32.37 | 0 |
| 32.38 | 0 |
| 32.39 | 0 |
| 32.4 | 0 |
| 32.41 | 0 |
| 32.42 | 0 |
| 32.43 | 0 |
| 32.44 | 0 |
| 32.45 | 0 |
| 32.46 | 0 |
| 32.47 | 0 |
| 32.48 | 0 |
| 32.49 | 0 |
| 32.5 | 0 |
| 32.51 | 0 |
| 32.52 | 0 |
| 32.53 | 0 |
| 32.54 | 0 |
| 32.55 | 0 |
| 32.56 | 0 |
| 32.57 | 0 |
| 32.58 | 0 |
| 32.59 | 0 |
| 32.6 | 0 |
| 32.61 | 0 |
| 32.62 | 0 |
| 32.63 | 0 |
| 32.64 | 0 |
| 32.65 | 0 |
| 32.66 | 0 |
| 32.67 | 0 |
| 32.68 | 0 |
| 32.69 | 0 |
| 32.7 | 0 |
| 32.71 | 0 |
| 32.72 | 0 |
| 32.73 | 0 |
| 32.74 | 0 |
| 32.75 | 0 |
| 32.76 | 0 |
| 32.77 | 0 |
| 32.78 | 0 |
| 32.79 | 0 |
| 32.8 | 0 |
| 32.81 | 0 |
| 32.82 | 0 |
| 32.83 | 0 |
| 32.84 | 0 |
| 32.85 | 0 |
| 32.86 | 0 |
| 32.87 | 0 |
| 32.88 | 0 |
| 32.89 | 0 |
| 32.9 | 0 |
| 32.91 | 0 |
| 32.92 | 0 |
| 32.93 | 0 |
| 32.94 | 0 |
| 32.95 | 0 |
| 32.96 | 0 |
| 32.97 | 0 |
| 32.98 | 0 |
| 32.99 | 0 |
| 33.0 | 0 |
| 33.01 | 0 |
| 33.02 | 0 |
| 33.03 | 0 |
| 33.04 | 0 |
| 33.05 | 0 |
| 33.06 | 0 |
| 33.07 | 0 |
| 33.08 | 0 |
| 33.09 | 0 |
| 33.1 | 0 |
| 33.11 | 0 |
| 33.12 | 0 |
| 33.13 | 0 |
| 33.14 | 0 |
| 33.15 | 0 |
| 33.16 | 0 |
| 33.17 | 0 |
| 33.18 | 0 |
| 33.19 | 0 |
| 33.2 | 0 |
| 33.21 | 0 |
| 33.22 | 0 |
| 33.23 | 0 |
| 33.24 | 0 |
| 33.25 | 0 |
| 33.26 | 0 |
| 33.27 | 0 |
| 33.28 | 0 |
| 33.29 | 0 |
| 33.3 | 0 |
| 33.31 | 0 |
| 33.32 | 0 |
| 33.33 | 0 |
| 33.34 | 0 |
| 33.35 | 0 |
| 33.36 | 0 |
| 33.37 | 0 |
| 33.38 | 0 |
| 33.39 | 0 |
| 33.4 | 0 |
| 33.41 | 0 |
| 33.42 | 0 |
| 33.43 | 0 |
| 33.44 | 0 |
| 33.45 | 0 |
| 33.46 | 0 |
| 33.47 | 0 |
| 33.48 | 0 |
| 33.49 | 0 |
| 33.5 | 0 |
| 33.51 | 0 |
| 33.52 | 0 |
| 33.53 | 0 |
| 33.54 | 0 |
| 33.55 | 0 |
| 33.56 | 0 |
| 33.57 | 0 |
| 33.58 | 0 |
| 33.59 | 0 |
| 33.6 | 0 |
| 33.61 | 0 |
| 33.62 | 0 |
| 33.63 | 0 |
| 33.64 | 0 |
| 33.65 | 0 |
| 33.66 | 0 |
| 33.67 | 0 |
| 33.68 | 0 |
| 33.69 | 0 |
| 33.7 | 0 |
| 33.71 | 0 |
| 33.72 | 0 |
| 33.73 | 0 |
| 33.74 | 0 |
| 33.75 | 0 |
| 33.76 | 0 |
| 33.77 | 0 |
| 33.78 | 0 |
| 33.79 | 0 |
| 33.8 | 0 |
| 33.81 | 0 |
| 33.82 | 0 |
| 33.83 | 0 |
| 33.84 | 0 |
| 33.85 | 0 |
| 33.86 | 0 |
| 33.87 | 0 |
| 33.88 | 0 |
| 33.89 | 0 |
| 33.9 | 0 |
| 33.91 | 0 |
| 33.92 | 0 |
| 33.93 | 0 |
| 33.94 | 0 |
| 33.95 | 0 |
| 33.96 | 0 |
| 33.97 | 0 |
| 33.98 | 0 |
| 33.99 | 0 |
| 34.0 | 0 |
| 34.01 | 0 |
| 34.02 | 0 |
| 34.03 | 0 |
| 34.04 | 0 |
| 34.05 | 0 |
| 34.06 | 0 |
| 34.07 | 0 |
| 34.08 | 0 |
| 34.09 | 0 |
| 34.1 | 0 |
| 34.11 | 0 |
| 34.12 | 0 |
| 34.13 | 0 |
| 34.14 | 0 |
| 34.15 | 0 |
| 34.16 | 0 |
| 34.17 | 0 |
| 34.18 | 0 |
| 34.19 | 0 |
| 34.2 | 0 |
| 34.21 | 0 |
| 34.22 | 0 |
| 34.23 | 0 |
| 34.24 | 0 |
| 34.25 | 0 |
| 34.26 | 0 |
| 34.27 | 0 |
| 34.28 | 0 |
| 34.29 | 0 |
| 34.3 | 0 |
| 34.31 | 0 |
| 34.32 | 0 |
| 34.33 | 0 |
| 34.34 | 0 |
| 34.35 | 0 |
| 34.36 | 0 |
| 34.37 | 0 |
| 34.38 | 0 |
| 34.39 | 0 |
| 34.4 | 0 |
| 34.41 | 0 |
| 34.42 | 0 |
| 34.43 | 0 |
| 34.44 | 0 |
| 34.45 | 0 |
| 34.46 | 0 |
| 34.47 | 0 |
| 34.48 | 0 |
| 34.49 | 0 |
| 34.5 | 0 |
| 34.51 | 0 |
| 34.52 | 0 |
| 34.53 | 0 |
| 34.54 | 0 |
| 34.55 | 0 |
| 34.56 | 0 |
| 34.57 | 0 |
| 34.58 | 0 |
| 34.59 | 0 |
| 34.6 | 0 |
| 34.61 | 0 |
| 34.62 | 0 |
| 34.63 | 0 |
| 34.64 | 0 |
| 34.65 | 0 |
| 34.66 | 0 |
| 34.67 | 0 |
| 34.68 | 0 |
| 34.69 | 0 |
| 34.7 | 0 |
| 34.71 | 0 |
| 34.72 | 0 |
| 34.73 | 0 |
| 34.74 | 0 |
| 34.75 | 0 |
| 34.76 | 0 |
| 34.77 | 0 |
| 34.78 | 0 |
| 34.79 | 0 |
| 34.8 | 0 |
| 34.81 | 0 |
| 34.82 | 0 |
| 34.83 | 0 |
| 34.84 | 0 |
| 34.85 | 0 |
| 34.86 | 0 |
| 34.87 | 0 |
| 34.88 | 0 |
| 34.89 | 0 |
| 34.9 | 0 |
| 34.91 | 0 |
| 34.92 | 0 |
| 34.93 | 0 |
| 34.94 | 0 |
| 34.95 | 0 |
| 34.96 | 0 |
| 34.97 | 0 |
| 34.98 | 0 |
| 34.99 | 0 |
| 35.0 | 0 |
| 35.01 | 0 |
| 35.02 | 0 |
| 35.03 | 0 |
| 35.04 | 0 |
| 35.05 | 0 |
| 35.06 | 0 |
| 35.07 | 0 |
| 35.08 | 0 |
| 35.09 | 0 |
| 35.1 | 0 |
| 35.11 | 0 |
| 35.12 | 0 |
| 35.13 | 0 |
| 35.14 | 0 |
| 35.15 | 0 |
| 35.16 | 0 |
| 35.17 | 0 |
| 35.18 | 0 |
| 35.19 | 0 |
| 35.2 | 0 |
| 35.21 | 0 |
| 35.22 | 0 |
| 35.23 | 0 |
| 35.24 | 0 |
| 35.25 | 0 |
| 35.26 | 0 |
| 35.27 | 0 |
| 35.28 | 0 |
| 35.29 | 0 |
| 35.3 | 0 |
| 35.31 | 0 |
| 35.32 | 0 |
| 35.33 | 0 |
| 35.34 | 0 |
| 35.35 | 0 |
| 35.36 | 0 |
| 35.37 | 0 |
| 35.38 | 0 |
| 35.39 | 0 |
| 35.4 | 0 |
| 35.41 | 0 |
| 35.42 | 0 |
| 35.43 | 0 |
| 35.44 | 0 |
| 35.45 | 0 |
| 35.46 | 0 |
| 35.47 | 0 |
| 35.48 | 0 |
| 35.49 | 0 |
| 35.5 | 0 |
| 35.51 | 0 |
| 35.52 | 0 |
| 35.53 | 0 |
| 35.54 | 0 |
| 35.55 | 0 |
| 35.56 | 0 |
| 35.57 | 0 |
| 35.58 | 0 |
| 35.59 | 0 |
| 35.6 | 0 |
| 35.61 | 0 |
| 35.62 | 0 |
| 35.63 | 0 |
| 35.64 | 0 |
| 35.65 | 0 |
| 35.66 | 0 |
| 35.67 | 0 |
| 35.68 | 0 |
| 35.69 | 0 |
| 35.7 | 0 |
| 35.71 | 0 |
| 35.72 | 0 |
| 35.73 | 0 |
| 35.74 | 0 |
| 35.75 | 0 |
| 35.76 | 0 |
| 35.77 | 0 |
| 35.78 | 0 |
| 35.79 | 0 |
| 35.8 | 0 |
| 35.81 | 0 |
| 35.82 | 0 |
| 35.83 | 0 |
| 35.84 | 0 |
| 35.85 | 0 |
| 35.86 | 0 |
| 35.87 | 0 |
| 35.88 | 0 |
| 35.89 | 0 |
| 35.9 | 0 |
| 35.91 | 0 |
| 35.92 | 0 |
| 35.93 | 0 |
| 35.94 | 0 |
| 35.95 | 0 |
| 35.96 | 0 |
| 35.97 | 0 |
| 35.98 | 0 |
| 35.99 | 0 |
| 36.0 | 0 |
| 36.01 | 0 |
| 36.02 | 0 |
| 36.03 | 0 |
| 36.04 | 0 |
| 36.05 | 0 |
| 36.06 | 0 |
| 36.07 | 0 |
| 36.08 | 0 |
| 36.09 | 0 |
| 36.1 | 0 |
| 36.11 | 0 |
| 36.12 | 0 |
| 36.13 | 0 |
| 36.14 | 0 |
| 36.15 | 0 |
| 36.16 | 0 |
| 36.17 | 0 |
| 36.18 | 0 |
| 36.19 | 0 |
| 36.2 | 0 |
| 36.21 | 0 |
| 36.22 | 0 |
| 36.23 | 0 |
| 36.24 | 0 |
| 36.25 | 0 |
| 36.26 | 0 |
| 36.27 | 0 |
| 36.28 | 0 |
| 36.29 | 0 |
| 36.3 | 0 |
| 36.31 | 0 |
| 36.32 | 0 |
| 36.33 | 0 |
| 36.34 | 0 |
| 36.35 | 0 |
| 36.36 | 0 |
| 36.37 | 0 |
| 36.38 | 0 |
| 36.39 | 0 |
| 36.4 | 0 |
| 36.41 | 0 |
| 36.42 | 0 |
| 36.43 | 0 |
| 36.44 | 0 |
| 36.45 | 0 |
| 36.46 | 0 |
| 36.47 | 0 |
| 36.48 | 0 |
| 36.49 | 0 |
| 36.5 | 0 |
| 36.51 | 0 |
| 36.52 | 0 |
| 36.53 | 0 |
| 36.54 | 0 |
| 36.55 | 0 |
| 36.56 | 0 |
| 36.57 | 0 |
| 36.58 | 0 |
| 36.59 | 0 |
| 36.6 | 0 |
| 36.61 | 0 |
| 36.62 | 0 |
| 36.63 | 0 |
| 36.64 | 0 |
| 36.65 | 0 |
| 36.66 | 0 |
| 36.67 | 0 |
| 36.68 | 0 |
| 36.69 | 0 |
| 36.7 | 0 |
| 36.71 | 0 |
| 36.72 | 0 |
| 36.73 | 0 |
| 36.74 | 0 |
| 36.75 | 0 |
| 36.76 | 0 |
| 36.77 | 0 |
| 36.78 | 0 |
| 36.79 | 0 |
| 36.8 | 0 |
| 36.81 | 0 |
| 36.82 | 0 |
| 36.83 | 0 |
| 36.84 | 0 |
| 36.85 | 0 |
| 36.86 | 0 |
| 36.87 | 0 |
| 36.88 | 0 |
| 36.89 | 0 |
| 36.9 | 0 |
| 36.91 | 0 |
| 36.92 | 0 |
| 36.93 | 0 |
| 36.94 | 0 |
| 36.95 | 0 |
| 36.96 | 0 |
| 36.97 | 0 |
| 36.98 | 0 |
| 36.99 | 0 |
| 37.0 | 0 |
| 37.01 | 0 |
| 37.02 | 0 |
| 37.03 | 0 |
| 37.04 | 0 |
| 37.05 | 0 |
| 37.06 | 0 |
| 37.07 | 0 |
| 37.08 | 0 |
| 37.09 | 0 |
| 37.1 | 0 |
| 37.11 | 0 |
| 37.12 | 0 |
| 37.13 | 0 |
| 37.14 | 0 |
| 37.15 | 0 |
| 37.16 | 0 |
| 37.17 | 0 |
| 37.18 | 0 |
| 37.19 | 0 |
| 37.2 | 0 |
| 37.21 | 0 |
| 37.22 | 0 |
| 37.23 | 0 |
| 37.24 | 0 |
| 37.25 | 0 |
| 37.26 | 0 |
| 37.27 | 0 |
| 37.28 | 0 |
| 37.29 | 0 |
| 37.3 | 0 |
| 37.31 | 0 |
| 37.32 | 0 |
| 37.33 | 0 |
| 37.34 | 0 |
| 37.35 | 0 |
| 37.36 | 0 |
| 37.37 | 0 |
| 37.38 | 0 |
| 37.39 | 0 |
| 37.4 | 0 |
| 37.41 | 0 |
| 37.42 | 0 |
| 37.43 | 0 |
| 37.44 | 0 |
| 37.45 | 0 |
| 37.46 | 0 |
| 37.47 | 0 |
| 37.48 | 0 |
| 37.49 | 0 |
| 37.5 | 0 |
| 37.51 | 0 |
| 37.52 | 0 |
| 37.53 | 0 |
| 37.54 | 0 |
| 37.55 | 0 |
| 37.56 | 0 |
| 37.57 | 0 |
| 37.58 | 0 |
| 37.59 | 0 |
| 37.6 | 0 |
| 37.61 | 0 |
| 37.62 | 0 |
| 37.63 | 0 |
| 37.64 | 0 |
| 37.65 | 0 |
| 37.66 | 0 |
| 37.67 | 0 |
| 37.68 | 0 |
| 37.69 | 0 |
| 37.7 | 0 |
| 37.71 | 0 |
| 37.72 | 0 |
| 37.73 | 0 |
| 37.74 | 0 |
| 37.75 | 0 |
| 37.76 | 0 |
| 37.77 | 0 |
| 37.78 | 0 |
| 37.79 | 0 |
| 37.8 | 0 |
| 37.81 | 0 |
| 37.82 | 0 |
| 37.83 | 0 |
| 37.84 | 0 |
| 37.85 | 0 |
| 37.86 | 0 |
| 37.87 | 0 |
| 37.88 | 0 |
| 37.89 | 0 |
| 37.9 | 0 |
| 37.91 | 0 |
| 37.92 | 0 |
| 37.93 | 0 |
| 37.94 | 0 |
| 37.95 | 0 |
| 37.96 | 0 |
| 37.97 | 0 |
| 37.98 | 0 |
| 37.99 | 0 |
| 38.0 | 0 |
| 38.01 | 0 |
| 38.02 | 0 |
| 38.03 | 0 |
| 38.04 | 0 |
| 38.05 | 0 |
| 38.06 | 0 |
| 38.07 | 0 |
| 38.08 | 0 |
| 38.09 | 0 |
| 38.1 | 0 |
| 38.11 | 0 |
| 38.12 | 0 |
| 38.13 | 0 |
| 38.14 | 0 |
| 38.15 | 0 |
| 38.16 | 0 |
| 38.17 | 0 |
| 38.18 | 0 |
| 38.19 | 0 |
| 38.2 | 0 |
| 38.21 | 0 |
| 38.22 | 0 |
| 38.23 | 0 |
| 38.24 | 0 |
| 38.25 | 0 |
| 38.26 | 0 |
| 38.27 | 0 |
| 38.28 | 0 |
| 38.29 | 0 |
| 38.3 | 0 |
| 38.31 | 0 |
| 38.32 | 0 |
| 38.33 | 0 |
| 38.34 | 0 |
| 38.35 | 0 |
| 38.36 | 0 |
| 38.37 | 0 |
| 38.38 | 0 |
| 38.39 | 0 |
| 38.4 | 0 |
| 38.41 | 0 |
| 38.42 | 0 |
| 38.43 | 0 |
| 38.44 | 0 |
| 38.45 | 0 |
| 38.46 | 0 |
| 38.47 | 0 |
| 38.48 | 0 |
| 38.49 | 0 |
| 38.5 | 0 |
| 38.51 | 0 |
| 38.52 | 0 |
| 38.53 | 0 |
| 38.54 | 0 |
| 38.55 | 0 |
| 38.56 | 0 |
| 38.57 | 0 |
| 38.58 | 0 |
| 38.59 | 0 |
| 38.6 | 0 |
| 38.61 | 0 |
| 38.62 | 0 |
| 38.63 | 0 |
| 38.64 | 0 |
| 38.65 | 0 |
| 38.66 | 0 |
| 38.67 | 0 |
| 38.68 | 0 |
| 38.69 | 0 |
| 38.7 | 0 |
| 38.71 | 0 |
| 38.72 | 0 |
| 38.73 | 0 |
| 38.74 | 0 |
| 38.75 | 0 |
| 38.76 | 0 |
| 38.77 | 0 |
| 38.78 | 0 |
| 38.79 | 0 |
| 38.8 | 0 |
| 38.81 | 0 |
| 38.82 | 0 |
| 38.83 | 0 |
| 38.84 | 0 |
| 38.85 | 0 |
| 38.86 | 0 |
| 38.87 | 0 |
| 38.88 | 0 |
| 38.89 | 0 |
| 38.9 | 0 |
| 38.91 | 0 |
| 38.92 | 0 |
| 38.93 | 0 |
| 38.94 | 0 |
| 38.95 | 0 |
| 38.96 | 0 |
| 38.97 | 0 |
| 38.98 | 0 |
| 38.99 | 0 |
| 39.0 | 0 |
| 39.01 | 0 |
| 39.02 | 0 |
| 39.03 | 0 |
| 39.04 | 0 |
| 39.05 | 0 |
| 39.06 | 0 |
| 39.07 | 0 |
| 39.08 | 0 |
| 39.09 | 0 |
| 39.1 | 0 |
| 39.11 | 0 |
| 39.12 | 0 |
| 39.13 | 0 |
| 39.14 | 0 |
| 39.15 | 0 |
| 39.16 | 0 |
| 39.17 | 0 |
| 39.18 | 0 |
| 39.19 | 0 |
| 39.2 | 0 |
| 39.21 | 0 |
| 39.22 | 0 |
| 39.23 | 0 |
| 39.24 | 0 |
| 39.25 | 0 |
| 39.26 | 0 |
| 39.27 | 0 |
| 39.28 | 0 |
| 39.29 | 0 |
| 39.3 | 0 |
| 39.31 | 0 |
| 39.32 | 0 |
| 39.33 | 0 |
| 39.34 | 0 |
| 39.35 | 0 |
| 39.36 | 0 |
| 39.37 | 0 |
| 39.38 | 0 |
| 39.39 | 0 |
| 39.4 | 0 |
| 39.41 | 0 |
| 39.42 | 0 |
| 39.43 | 0 |
| 39.44 | 0 |
| 39.45 | 0 |
| 39.46 | 0 |
| 39.47 | 0 |
| 39.48 | 0 |
| 39.49 | 0 |
| 39.5 | 0 |
| 39.51 | 0 |
| 39.52 | 0 |
| 39.53 | 0 |
| 39.54 | 0 |
| 39.55 | 0 |
| 39.56 | 0 |
| 39.57 | 0 |
| 39.58 | 0 |
| 39.59 | 0 |
| 39.6 | 0 |
| 39.61 | 0 |
| 39.62 | 0 |
| 39.63 | 0 |
| 39.64 | 0 |
| 39.65 | 0 |
| 39.66 | 0 |
| 39.67 | 0 |
| 39.68 | 0 |
| 39.69 | 0 |
| 39.7 | 0 |
| 39.71 | 0 |
| 39.72 | 0 |
| 39.73 | 0 |
| 39.74 | 0 |
| 39.75 | 0 |
| 39.76 | 0 |
| 39.77 | 0 |
| 39.78 | 0 |
| 39.79 | 0 |
| 39.8 | 0 |
| 39.81 | 0 |
| 39.82 | 0 |
| 39.83 | 0 |
| 39.84 | 0 |
| 39.85 | 0 |
| 39.86 | 0 |
| 39.87 | 0 |
| 39.88 | 0 |
| 39.89 | 0 |
| 39.9 | 0 |
| 39.91 | 0 |
| 39.92 | 0 |
| 39.93 | 0 |
| 39.94 | 0 |
| 39.95 | 0 |
| 39.96 | 0 |
| 39.97 | 0 |
| 39.98 | 0 |
| 39.99 | 0 |
| 40.0 | 0 |
| 40.01 | 0 |
| 40.02 | 0 |
| 40.03 | 0 |
| 40.04 | 0 |
| 40.05 | 0 |
| 40.06 | 0 |
| 40.07 | 0 |
| 40.08 | 0 |
| 40.09 | 0 |
| 40.1 | 0 |
| 40.11 | 0 |
| 40.12 | 0 |
| 40.13 | 0 |
| 40.14 | 0 |
| 40.15 | 0 |
| 40.16 | 0 |
| 40.17 | 0 |
| 40.18 | 0 |
| 40.19 | 0 |
| 40.2 | 0 |
| 40.21 | 0 |
| 40.22 | 0 |
| 40.23 | 0 |
| 40.24 | 0 |
| 40.25 | 0 |
| 40.26 | 0 |
| 40.27 | 0 |
| 40.28 | 0 |
| 40.29 | 0 |
| 40.3 | 0 |
| 40.31 | 0 |
| 40.32 | 0 |
| 40.33 | 0 |
| 40.34 | 0 |
| 40.35 | 0 |
| 40.36 | 0 |
| 40.37 | 0 |
| 40.38 | 0 |
| 40.39 | 0 |
| 40.4 | 0 |
| 40.41 | 0 |
| 40.42 | 0 |
| 40.43 | 0 |
| 40.44 | 0 |
| 40.45 | 0 |
| 40.46 | 0 |
| 40.47 | 0 |
| 40.48 | 0 |
| 40.49 | 0 |
| 40.5 | 0 |
| 40.51 | 0 |
| 40.52 | 0 |
| 40.53 | 0 |
| 40.54 | 0 |
| 40.55 | 0 |
| 40.56 | 0 |
| 40.57 | 0 |
| 40.58 | 0 |
| 40.59 | 0 |
| 40.6 | 0 |
| 40.61 | 0 |
| 40.62 | 0 |
| 40.63 | 0 |
| 40.64 | 0 |
| 40.65 | 0 |
| 40.66 | 0 |
| 40.67 | 0 |
| 40.68 | 0 |
| 40.69 | 0 |
| 40.7 | 0 |
| 40.71 | 0 |
| 40.72 | 0 |
| 40.73 | 0 |
| 40.74 | 0 |
| 40.75 | 0 |
| 40.76 | 0 |
| 40.77 | 0 |
| 40.78 | 0 |
| 40.79 | 0 |
| 40.8 | 0 |
| 40.81 | 0 |
| 40.82 | 0 |
| 40.83 | 0 |
| 40.84 | 0 |
| 40.85 | 0 |
| 40.86 | 0 |
| 40.87 | 0 |
| 40.88 | 0 |
| 40.89 | 0 |
| 40.9 | 0 |
| 40.91 | 0 |
| 40.92 | 0 |
| 40.93 | 0 |
| 40.94 | 0 |
| 40.95 | 0 |